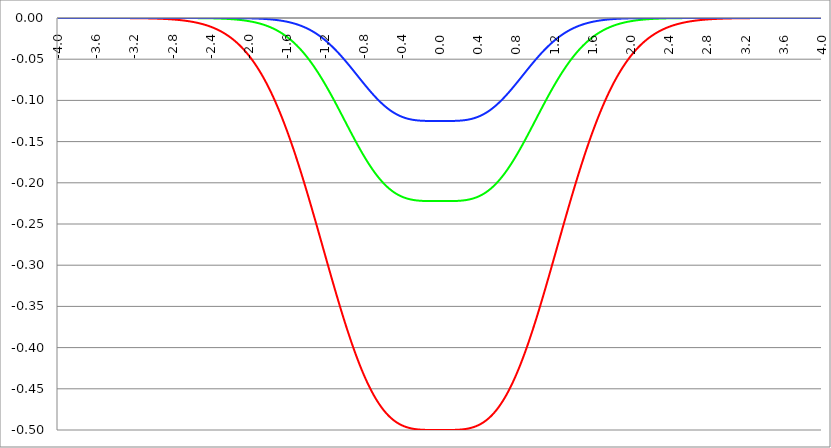
| Category | Series 1 | Series 0 | Series 2 |
|---|---|---|---|
| -4.0 | 0 | 0 | 0 |
| -3.996 | 0 | 0 | 0 |
| -3.992 | 0 | 0 | 0 |
| -3.988 | 0 | 0 | 0 |
| -3.984 | 0 | 0 | 0 |
| -3.98 | 0 | 0 | 0 |
| -3.976 | 0 | 0 | 0 |
| -3.972 | 0 | 0 | 0 |
| -3.968 | 0 | 0 | 0 |
| -3.964 | 0 | 0 | 0 |
| -3.96 | 0 | 0 | 0 |
| -3.956 | 0 | 0 | 0 |
| -3.952 | 0 | 0 | 0 |
| -3.948 | 0 | 0 | 0 |
| -3.944 | 0 | 0 | 0 |
| -3.94 | 0 | 0 | 0 |
| -3.936 | 0 | 0 | 0 |
| -3.932 | 0 | 0 | 0 |
| -3.928 | 0 | 0 | 0 |
| -3.924 | 0 | 0 | 0 |
| -3.92 | 0 | 0 | 0 |
| -3.916 | 0 | 0 | 0 |
| -3.912 | 0 | 0 | 0 |
| -3.908 | 0 | 0 | 0 |
| -3.904 | 0 | 0 | 0 |
| -3.9 | 0 | 0 | 0 |
| -3.896 | 0 | 0 | 0 |
| -3.892 | 0 | 0 | 0 |
| -3.888 | 0 | 0 | 0 |
| -3.884 | 0 | 0 | 0 |
| -3.88 | 0 | 0 | 0 |
| -3.876 | 0 | 0 | 0 |
| -3.872 | 0 | 0 | 0 |
| -3.868 | 0 | 0 | 0 |
| -3.864 | 0 | 0 | 0 |
| -3.86 | 0 | 0 | 0 |
| -3.856 | 0 | 0 | 0 |
| -3.852 | 0 | 0 | 0 |
| -3.848 | 0 | 0 | 0 |
| -3.844 | 0 | 0 | 0 |
| -3.84 | 0 | 0 | 0 |
| -3.836 | 0 | 0 | 0 |
| -3.832 | 0 | 0 | 0 |
| -3.828 | 0 | 0 | 0 |
| -3.824 | 0 | 0 | 0 |
| -3.82 | 0 | 0 | 0 |
| -3.816 | 0 | 0 | 0 |
| -3.812 | 0 | 0 | 0 |
| -3.808 | 0 | 0 | 0 |
| -3.804 | 0 | 0 | 0 |
| -3.8 | 0 | 0 | 0 |
| -3.796 | 0 | 0 | 0 |
| -3.792 | 0 | 0 | 0 |
| -3.788 | 0 | 0 | 0 |
| -3.784 | 0 | 0 | 0 |
| -3.78 | 0 | 0 | 0 |
| -3.776 | 0 | 0 | 0 |
| -3.772 | 0 | 0 | 0 |
| -3.768 | 0 | 0 | 0 |
| -3.764 | 0 | 0 | 0 |
| -3.76 | 0 | 0 | 0 |
| -3.756 | 0 | 0 | 0 |
| -3.752 | 0 | 0 | 0 |
| -3.748 | 0 | 0 | 0 |
| -3.744 | 0 | 0 | 0 |
| -3.74 | 0 | 0 | 0 |
| -3.736 | 0 | 0 | 0 |
| -3.732 | 0 | 0 | 0 |
| -3.728 | 0 | 0 | 0 |
| -3.724 | 0 | 0 | 0 |
| -3.72 | 0 | 0 | 0 |
| -3.716 | 0 | 0 | 0 |
| -3.712 | 0 | 0 | 0 |
| -3.708 | 0 | 0 | 0 |
| -3.704 | 0 | 0 | 0 |
| -3.7 | 0 | 0 | 0 |
| -3.696 | 0 | 0 | 0 |
| -3.692 | 0 | 0 | 0 |
| -3.688 | 0 | 0 | 0 |
| -3.684 | 0 | 0 | 0 |
| -3.68 | 0 | 0 | 0 |
| -3.676 | 0 | 0 | 0 |
| -3.672 | 0 | 0 | 0 |
| -3.668 | 0 | 0 | 0 |
| -3.664 | 0 | 0 | 0 |
| -3.66 | 0 | 0 | 0 |
| -3.656 | 0 | 0 | 0 |
| -3.652 | 0 | 0 | 0 |
| -3.648 | 0 | 0 | 0 |
| -3.644 | 0 | 0 | 0 |
| -3.64 | 0 | 0 | 0 |
| -3.636 | 0 | 0 | 0 |
| -3.632 | 0 | 0 | 0 |
| -3.628 | 0 | 0 | 0 |
| -3.624 | 0 | 0 | 0 |
| -3.62 | 0 | 0 | 0 |
| -3.616 | 0 | 0 | 0 |
| -3.612 | 0 | 0 | 0 |
| -3.608 | 0 | 0 | 0 |
| -3.604 | 0 | 0 | 0 |
| -3.6 | 0 | 0 | 0 |
| -3.596 | 0 | 0 | 0 |
| -3.592 | 0 | 0 | 0 |
| -3.588 | 0 | 0 | 0 |
| -3.584 | 0 | 0 | 0 |
| -3.58 | 0 | 0 | 0 |
| -3.576 | 0 | 0 | 0 |
| -3.572 | 0 | 0 | 0 |
| -3.568 | 0 | 0 | 0 |
| -3.564 | 0 | 0 | 0 |
| -3.56 | 0 | 0 | 0 |
| -3.556 | 0 | 0 | 0 |
| -3.552 | 0 | 0 | 0 |
| -3.548 | 0 | 0 | 0 |
| -3.544 | 0 | 0 | 0 |
| -3.54 | 0 | 0 | 0 |
| -3.536 | 0 | 0 | 0 |
| -3.532 | 0 | 0 | 0 |
| -3.528 | 0 | 0 | 0 |
| -3.524 | 0 | 0 | 0 |
| -3.52 | 0 | 0 | 0 |
| -3.516 | 0 | 0 | 0 |
| -3.512 | 0 | 0 | 0 |
| -3.508 | 0 | 0 | 0 |
| -3.504 | 0 | 0 | 0 |
| -3.5 | 0 | 0 | 0 |
| -3.496 | 0 | 0 | 0 |
| -3.492 | 0 | 0 | 0 |
| -3.488 | 0 | 0 | 0 |
| -3.484 | 0 | 0 | 0 |
| -3.48 | 0 | 0 | 0 |
| -3.476 | 0 | 0 | 0 |
| -3.472 | 0 | 0 | 0 |
| -3.467999999999999 | 0 | 0 | 0 |
| -3.463999999999999 | 0 | 0 | 0 |
| -3.459999999999999 | 0 | 0 | 0 |
| -3.455999999999999 | 0 | 0 | 0 |
| -3.451999999999999 | 0 | 0 | 0 |
| -3.447999999999999 | 0 | 0 | 0 |
| -3.443999999999999 | 0 | 0 | 0 |
| -3.439999999999999 | 0 | 0 | 0 |
| -3.435999999999999 | 0 | 0 | 0 |
| -3.431999999999999 | 0 | 0 | 0 |
| -3.427999999999999 | 0 | 0 | 0 |
| -3.423999999999999 | 0 | 0 | 0 |
| -3.419999999999999 | 0 | 0 | 0 |
| -3.415999999999999 | 0 | 0 | 0 |
| -3.411999999999999 | 0 | 0 | 0 |
| -3.407999999999999 | 0 | 0 | 0 |
| -3.403999999999999 | 0 | 0 | 0 |
| -3.399999999999999 | 0 | 0 | 0 |
| -3.395999999999999 | 0 | 0 | 0 |
| -3.391999999999999 | 0 | 0 | 0 |
| -3.387999999999999 | 0 | 0 | 0 |
| -3.383999999999999 | 0 | 0 | 0 |
| -3.379999999999999 | 0 | 0 | 0 |
| -3.375999999999999 | 0 | 0 | 0 |
| -3.371999999999999 | 0 | 0 | 0 |
| -3.367999999999999 | 0 | 0 | 0 |
| -3.363999999999999 | 0 | 0 | 0 |
| -3.359999999999999 | 0 | 0 | 0 |
| -3.355999999999999 | 0 | 0 | 0 |
| -3.351999999999999 | 0 | 0 | 0 |
| -3.347999999999999 | 0 | 0 | 0 |
| -3.343999999999999 | 0 | 0 | 0 |
| -3.339999999999999 | 0 | 0 | 0 |
| -3.335999999999999 | 0 | 0 | 0 |
| -3.331999999999999 | 0 | 0 | 0 |
| -3.327999999999999 | 0 | 0 | 0 |
| -3.323999999999999 | 0 | 0 | 0 |
| -3.319999999999999 | 0 | 0 | 0 |
| -3.315999999999999 | 0 | 0 | 0 |
| -3.311999999999999 | 0 | 0 | 0 |
| -3.307999999999999 | 0 | 0 | 0 |
| -3.303999999999999 | 0 | 0 | 0 |
| -3.299999999999999 | 0 | 0 | 0 |
| -3.295999999999999 | 0 | 0 | 0 |
| -3.291999999999999 | 0 | 0 | 0 |
| -3.288 | 0 | 0 | 0 |
| -3.284 | 0 | 0 | 0 |
| -3.279999999999999 | 0 | 0 | 0 |
| -3.275999999999999 | 0 | 0 | 0 |
| -3.271999999999999 | 0 | 0 | 0 |
| -3.268 | 0 | 0 | 0 |
| -3.264 | 0 | 0 | 0 |
| -3.259999999999999 | 0 | 0 | 0 |
| -3.255999999999999 | 0 | 0 | 0 |
| -3.251999999999999 | 0 | 0 | 0 |
| -3.248 | 0 | 0 | 0 |
| -3.244 | 0 | 0 | 0 |
| -3.239999999999999 | 0 | 0 | 0 |
| -3.235999999999999 | 0 | 0 | 0 |
| -3.231999999999999 | 0 | 0 | 0 |
| -3.228 | 0 | 0 | 0 |
| -3.224 | 0 | 0 | 0 |
| -3.219999999999999 | 0 | 0 | 0 |
| -3.215999999999999 | 0 | 0 | 0 |
| -3.211999999999999 | 0 | 0 | 0 |
| -3.208 | 0 | 0 | 0 |
| -3.204 | 0 | 0 | 0 |
| -3.199999999999999 | 0 | 0 | 0 |
| -3.195999999999999 | 0 | 0 | 0 |
| -3.191999999999999 | 0 | 0 | 0 |
| -3.188 | 0 | 0 | 0 |
| -3.184 | 0 | 0 | 0 |
| -3.179999999999999 | 0 | 0 | 0 |
| -3.175999999999999 | 0 | 0 | 0 |
| -3.171999999999999 | 0 | 0 | 0 |
| -3.168 | 0 | 0 | 0 |
| -3.164 | 0 | 0 | 0 |
| -3.159999999999999 | 0 | 0 | 0 |
| -3.155999999999999 | 0 | 0 | 0 |
| -3.151999999999999 | 0 | 0 | 0 |
| -3.148 | 0 | 0 | 0 |
| -3.144 | 0 | 0 | 0 |
| -3.139999999999999 | 0 | 0 | 0 |
| -3.135999999999999 | 0 | 0 | 0 |
| -3.131999999999999 | 0 | 0 | 0 |
| -3.128 | 0 | 0 | 0 |
| -3.124 | 0 | 0 | 0 |
| -3.119999999999999 | 0 | 0 | 0 |
| -3.115999999999999 | 0 | 0 | 0 |
| -3.111999999999999 | 0 | 0 | 0 |
| -3.108 | 0 | 0 | 0 |
| -3.104 | 0 | 0 | 0 |
| -3.099999999999999 | 0 | 0 | 0 |
| -3.095999999999999 | 0 | 0 | 0 |
| -3.091999999999999 | 0 | 0 | 0 |
| -3.088 | 0 | 0 | 0 |
| -3.084 | 0 | 0 | 0 |
| -3.079999999999999 | 0 | 0 | 0 |
| -3.075999999999999 | 0 | 0 | 0 |
| -3.071999999999999 | 0 | 0 | 0 |
| -3.068 | 0 | 0 | 0 |
| -3.064 | 0 | 0 | 0 |
| -3.059999999999999 | 0 | 0 | 0 |
| -3.055999999999999 | 0 | 0 | 0 |
| -3.051999999999999 | 0 | 0 | 0 |
| -3.048 | 0 | 0 | 0 |
| -3.044 | 0 | 0 | 0 |
| -3.039999999999999 | 0 | 0 | 0 |
| -3.035999999999999 | -0.001 | 0 | 0 |
| -3.031999999999999 | -0.001 | 0 | 0 |
| -3.028 | -0.001 | 0 | 0 |
| -3.024 | -0.001 | 0 | 0 |
| -3.019999999999999 | -0.001 | 0 | 0 |
| -3.015999999999999 | -0.001 | 0 | 0 |
| -3.011999999999999 | -0.001 | 0 | 0 |
| -3.008 | -0.001 | 0 | 0 |
| -3.004 | -0.001 | 0 | 0 |
| -2.999999999999999 | -0.001 | 0 | 0 |
| -2.995999999999999 | -0.001 | 0 | 0 |
| -2.991999999999999 | -0.001 | 0 | 0 |
| -2.988 | -0.001 | 0 | 0 |
| -2.984 | -0.001 | 0 | 0 |
| -2.979999999999999 | -0.001 | 0 | 0 |
| -2.975999999999999 | -0.001 | 0 | 0 |
| -2.971999999999999 | -0.001 | 0 | 0 |
| -2.968 | -0.001 | 0 | 0 |
| -2.964 | -0.001 | 0 | 0 |
| -2.959999999999999 | -0.001 | 0 | 0 |
| -2.955999999999999 | -0.001 | 0 | 0 |
| -2.951999999999999 | -0.001 | 0 | 0 |
| -2.948 | -0.001 | 0 | 0 |
| -2.944 | -0.001 | 0 | 0 |
| -2.939999999999999 | -0.001 | 0 | 0 |
| -2.935999999999999 | -0.001 | 0 | 0 |
| -2.931999999999999 | -0.001 | 0 | 0 |
| -2.928 | -0.001 | 0 | 0 |
| -2.924 | -0.001 | 0 | 0 |
| -2.919999999999999 | -0.001 | 0 | 0 |
| -2.915999999999999 | -0.001 | 0 | 0 |
| -2.911999999999999 | -0.001 | 0 | 0 |
| -2.908 | -0.001 | 0 | 0 |
| -2.904 | -0.001 | 0 | 0 |
| -2.899999999999999 | -0.001 | 0 | 0 |
| -2.895999999999999 | -0.001 | 0 | 0 |
| -2.891999999999999 | -0.001 | 0 | 0 |
| -2.887999999999999 | -0.001 | 0 | 0 |
| -2.883999999999999 | -0.001 | 0 | 0 |
| -2.879999999999999 | -0.001 | 0 | 0 |
| -2.875999999999999 | -0.001 | 0 | 0 |
| -2.871999999999999 | -0.001 | 0 | 0 |
| -2.867999999999999 | -0.001 | 0 | 0 |
| -2.863999999999999 | -0.001 | 0 | 0 |
| -2.859999999999999 | -0.001 | 0 | 0 |
| -2.855999999999999 | -0.001 | 0 | 0 |
| -2.851999999999999 | -0.001 | 0 | 0 |
| -2.847999999999999 | -0.001 | 0 | 0 |
| -2.843999999999999 | -0.001 | 0 | 0 |
| -2.839999999999999 | -0.001 | 0 | 0 |
| -2.835999999999999 | -0.001 | 0 | 0 |
| -2.831999999999999 | -0.001 | 0 | 0 |
| -2.827999999999999 | -0.002 | 0 | 0 |
| -2.823999999999999 | -0.002 | 0 | 0 |
| -2.819999999999999 | -0.002 | 0 | 0 |
| -2.815999999999999 | -0.002 | 0 | 0 |
| -2.811999999999999 | -0.002 | 0 | 0 |
| -2.807999999999999 | -0.002 | 0 | 0 |
| -2.803999999999999 | -0.002 | 0 | 0 |
| -2.799999999999999 | -0.002 | 0 | 0 |
| -2.795999999999999 | -0.002 | 0 | 0 |
| -2.791999999999999 | -0.002 | 0 | 0 |
| -2.787999999999999 | -0.002 | 0 | 0 |
| -2.783999999999999 | -0.002 | 0 | 0 |
| -2.779999999999999 | -0.002 | 0 | 0 |
| -2.775999999999999 | -0.002 | 0 | 0 |
| -2.771999999999999 | -0.002 | 0 | 0 |
| -2.767999999999999 | -0.002 | 0 | 0 |
| -2.763999999999999 | -0.002 | 0 | 0 |
| -2.759999999999999 | -0.002 | 0 | 0 |
| -2.755999999999999 | -0.002 | 0 | 0 |
| -2.751999999999999 | -0.002 | 0 | 0 |
| -2.747999999999999 | -0.002 | 0 | 0 |
| -2.743999999999999 | -0.002 | 0 | 0 |
| -2.739999999999999 | -0.002 | 0 | 0 |
| -2.735999999999999 | -0.002 | 0 | 0 |
| -2.731999999999999 | -0.002 | 0 | 0 |
| -2.727999999999999 | -0.002 | 0 | 0 |
| -2.723999999999999 | -0.003 | 0 | 0 |
| -2.719999999999999 | -0.003 | 0 | 0 |
| -2.715999999999999 | -0.003 | 0 | 0 |
| -2.711999999999999 | -0.003 | 0 | 0 |
| -2.707999999999999 | -0.003 | 0 | 0 |
| -2.703999999999999 | -0.003 | 0 | 0 |
| -2.699999999999999 | -0.003 | 0 | 0 |
| -2.695999999999999 | -0.003 | 0 | 0 |
| -2.691999999999999 | -0.003 | 0 | 0 |
| -2.687999999999999 | -0.003 | 0 | 0 |
| -2.683999999999999 | -0.003 | 0 | 0 |
| -2.679999999999999 | -0.003 | 0 | 0 |
| -2.675999999999999 | -0.003 | 0 | 0 |
| -2.671999999999999 | -0.003 | 0 | 0 |
| -2.667999999999999 | -0.003 | 0 | 0 |
| -2.663999999999999 | -0.003 | 0 | 0 |
| -2.659999999999999 | -0.003 | 0 | 0 |
| -2.655999999999999 | -0.003 | 0 | 0 |
| -2.651999999999999 | -0.004 | 0 | 0 |
| -2.647999999999999 | -0.004 | 0 | 0 |
| -2.643999999999999 | -0.004 | 0 | 0 |
| -2.639999999999999 | -0.004 | 0 | 0 |
| -2.635999999999999 | -0.004 | 0 | 0 |
| -2.631999999999999 | -0.004 | 0 | 0 |
| -2.627999999999999 | -0.004 | 0 | 0 |
| -2.623999999999999 | -0.004 | 0 | 0 |
| -2.619999999999999 | -0.004 | 0 | 0 |
| -2.615999999999999 | -0.004 | 0 | 0 |
| -2.611999999999999 | -0.004 | 0 | 0 |
| -2.607999999999999 | -0.004 | 0 | 0 |
| -2.603999999999999 | -0.004 | 0 | 0 |
| -2.599999999999999 | -0.004 | 0 | 0 |
| -2.595999999999999 | -0.005 | 0 | 0 |
| -2.591999999999999 | -0.005 | 0 | 0 |
| -2.587999999999999 | -0.005 | 0 | 0 |
| -2.583999999999999 | -0.005 | 0 | 0 |
| -2.579999999999999 | -0.005 | 0 | 0 |
| -2.575999999999999 | -0.005 | 0 | 0 |
| -2.571999999999999 | -0.005 | 0 | 0 |
| -2.567999999999999 | -0.005 | 0 | 0 |
| -2.563999999999999 | -0.005 | 0 | 0 |
| -2.559999999999999 | -0.005 | 0 | 0 |
| -2.555999999999999 | -0.005 | 0 | 0 |
| -2.551999999999999 | -0.006 | 0 | 0 |
| -2.547999999999999 | -0.006 | 0 | 0 |
| -2.543999999999999 | -0.006 | 0 | 0 |
| -2.539999999999999 | -0.006 | 0 | 0 |
| -2.535999999999999 | -0.006 | 0 | 0 |
| -2.531999999999999 | -0.006 | 0 | 0 |
| -2.527999999999999 | -0.006 | 0 | 0 |
| -2.523999999999999 | -0.006 | 0 | 0 |
| -2.519999999999999 | -0.006 | 0 | 0 |
| -2.515999999999999 | -0.007 | 0 | 0 |
| -2.511999999999999 | -0.007 | 0 | 0 |
| -2.507999999999999 | -0.007 | 0 | 0 |
| -2.503999999999999 | -0.007 | 0 | 0 |
| -2.499999999999999 | -0.007 | 0 | 0 |
| -2.495999999999999 | -0.007 | 0 | 0 |
| -2.491999999999999 | -0.007 | 0 | 0 |
| -2.487999999999999 | -0.007 | 0 | 0 |
| -2.483999999999999 | -0.007 | 0 | 0 |
| -2.479999999999999 | -0.008 | 0 | 0 |
| -2.475999999999999 | -0.008 | 0 | 0 |
| -2.471999999999999 | -0.008 | 0 | 0 |
| -2.467999999999999 | -0.008 | 0 | 0 |
| -2.463999999999999 | -0.008 | 0 | 0 |
| -2.459999999999999 | -0.008 | 0 | 0 |
| -2.455999999999999 | -0.008 | 0 | 0 |
| -2.451999999999999 | -0.009 | 0 | 0 |
| -2.447999999999999 | -0.009 | 0 | 0 |
| -2.443999999999999 | -0.009 | 0 | 0 |
| -2.439999999999999 | -0.009 | 0 | 0 |
| -2.435999999999999 | -0.009 | 0 | 0 |
| -2.431999999999999 | -0.009 | 0 | 0 |
| -2.427999999999999 | -0.009 | 0 | 0 |
| -2.423999999999999 | -0.01 | 0 | 0 |
| -2.419999999999999 | -0.01 | 0 | 0 |
| -2.415999999999999 | -0.01 | 0 | 0 |
| -2.411999999999999 | -0.01 | 0 | 0 |
| -2.407999999999999 | -0.01 | 0 | 0 |
| -2.403999999999999 | -0.01 | 0 | 0 |
| -2.399999999999999 | -0.011 | 0 | 0 |
| -2.395999999999999 | -0.011 | 0 | 0 |
| -2.391999999999999 | -0.011 | 0 | 0 |
| -2.387999999999999 | -0.011 | 0 | 0 |
| -2.383999999999999 | -0.011 | 0 | 0 |
| -2.379999999999999 | -0.012 | 0 | 0 |
| -2.375999999999999 | -0.012 | 0 | 0 |
| -2.371999999999999 | -0.012 | 0 | 0 |
| -2.367999999999998 | -0.012 | 0 | 0 |
| -2.363999999999998 | -0.012 | 0 | 0 |
| -2.359999999999998 | -0.013 | 0 | 0 |
| -2.355999999999998 | -0.013 | -0.001 | 0 |
| -2.351999999999998 | -0.013 | -0.001 | 0 |
| -2.347999999999998 | -0.013 | -0.001 | 0 |
| -2.343999999999998 | -0.013 | -0.001 | 0 |
| -2.339999999999998 | -0.014 | -0.001 | 0 |
| -2.335999999999998 | -0.014 | -0.001 | 0 |
| -2.331999999999998 | -0.014 | -0.001 | 0 |
| -2.327999999999998 | -0.014 | -0.001 | 0 |
| -2.323999999999998 | -0.014 | -0.001 | 0 |
| -2.319999999999998 | -0.015 | -0.001 | 0 |
| -2.315999999999998 | -0.015 | -0.001 | 0 |
| -2.311999999999998 | -0.015 | -0.001 | 0 |
| -2.307999999999998 | -0.015 | -0.001 | 0 |
| -2.303999999999998 | -0.016 | -0.001 | 0 |
| -2.299999999999998 | -0.016 | -0.001 | 0 |
| -2.295999999999998 | -0.016 | -0.001 | 0 |
| -2.291999999999998 | -0.016 | -0.001 | 0 |
| -2.287999999999998 | -0.017 | -0.001 | 0 |
| -2.283999999999998 | -0.017 | -0.001 | 0 |
| -2.279999999999998 | -0.017 | -0.001 | 0 |
| -2.275999999999998 | -0.017 | -0.001 | 0 |
| -2.271999999999998 | -0.018 | -0.001 | 0 |
| -2.267999999999998 | -0.018 | -0.001 | 0 |
| -2.263999999999998 | -0.018 | -0.001 | 0 |
| -2.259999999999998 | -0.018 | -0.001 | 0 |
| -2.255999999999998 | -0.019 | -0.001 | 0 |
| -2.251999999999998 | -0.019 | -0.001 | 0 |
| -2.247999999999998 | -0.019 | -0.001 | 0 |
| -2.243999999999998 | -0.02 | -0.001 | 0 |
| -2.239999999999998 | -0.02 | -0.001 | 0 |
| -2.235999999999998 | -0.02 | -0.001 | 0 |
| -2.231999999999998 | -0.021 | -0.001 | 0 |
| -2.227999999999998 | -0.021 | -0.001 | 0 |
| -2.223999999999998 | -0.021 | -0.001 | 0 |
| -2.219999999999998 | -0.021 | -0.001 | 0 |
| -2.215999999999998 | -0.022 | -0.001 | 0 |
| -2.211999999999998 | -0.022 | -0.001 | 0 |
| -2.207999999999998 | -0.022 | -0.001 | 0 |
| -2.203999999999998 | -0.023 | -0.001 | 0 |
| -2.199999999999998 | -0.023 | -0.001 | 0 |
| -2.195999999999998 | -0.023 | -0.001 | 0 |
| -2.191999999999998 | -0.024 | -0.001 | 0 |
| -2.187999999999998 | -0.024 | -0.001 | 0 |
| -2.183999999999998 | -0.024 | -0.001 | 0 |
| -2.179999999999998 | -0.025 | -0.001 | 0 |
| -2.175999999999998 | -0.025 | -0.001 | 0 |
| -2.171999999999998 | -0.026 | -0.002 | 0 |
| -2.167999999999998 | -0.026 | -0.002 | 0 |
| -2.163999999999998 | -0.026 | -0.002 | 0 |
| -2.159999999999998 | -0.027 | -0.002 | 0 |
| -2.155999999999998 | -0.027 | -0.002 | 0 |
| -2.151999999999998 | -0.027 | -0.002 | 0 |
| -2.147999999999998 | -0.028 | -0.002 | 0 |
| -2.143999999999998 | -0.028 | -0.002 | 0 |
| -2.139999999999998 | -0.029 | -0.002 | 0 |
| -2.135999999999998 | -0.029 | -0.002 | 0 |
| -2.131999999999998 | -0.029 | -0.002 | 0 |
| -2.127999999999998 | -0.03 | -0.002 | 0 |
| -2.123999999999998 | -0.03 | -0.002 | 0 |
| -2.119999999999998 | -0.031 | -0.002 | 0 |
| -2.115999999999998 | -0.031 | -0.002 | 0 |
| -2.111999999999998 | -0.032 | -0.002 | 0 |
| -2.107999999999998 | -0.032 | -0.002 | 0 |
| -2.103999999999998 | -0.032 | -0.002 | 0 |
| -2.099999999999998 | -0.033 | -0.002 | 0 |
| -2.095999999999998 | -0.033 | -0.002 | 0 |
| -2.091999999999998 | -0.034 | -0.002 | 0 |
| -2.087999999999998 | -0.034 | -0.002 | 0 |
| -2.083999999999998 | -0.035 | -0.002 | 0 |
| -2.079999999999998 | -0.035 | -0.003 | 0 |
| -2.075999999999998 | -0.036 | -0.003 | 0 |
| -2.071999999999998 | -0.036 | -0.003 | 0 |
| -2.067999999999998 | -0.037 | -0.003 | 0 |
| -2.063999999999998 | -0.037 | -0.003 | 0 |
| -2.059999999999998 | -0.038 | -0.003 | 0 |
| -2.055999999999998 | -0.038 | -0.003 | 0 |
| -2.051999999999998 | -0.039 | -0.003 | 0 |
| -2.047999999999998 | -0.039 | -0.003 | 0 |
| -2.043999999999998 | -0.04 | -0.003 | 0 |
| -2.039999999999998 | -0.04 | -0.003 | 0 |
| -2.035999999999998 | -0.041 | -0.003 | 0 |
| -2.031999999999998 | -0.041 | -0.003 | 0 |
| -2.027999999999998 | -0.042 | -0.003 | 0 |
| -2.023999999999998 | -0.042 | -0.003 | 0 |
| -2.019999999999998 | -0.043 | -0.003 | 0 |
| -2.015999999999998 | -0.043 | -0.004 | 0 |
| -2.011999999999998 | -0.044 | -0.004 | 0 |
| -2.007999999999998 | -0.045 | -0.004 | 0 |
| -2.003999999999998 | -0.045 | -0.004 | 0 |
| -1.999999999999998 | -0.046 | -0.004 | 0 |
| -1.995999999999998 | -0.046 | -0.004 | 0 |
| -1.991999999999998 | -0.047 | -0.004 | 0 |
| -1.987999999999998 | -0.048 | -0.004 | 0 |
| -1.983999999999998 | -0.048 | -0.004 | 0 |
| -1.979999999999998 | -0.049 | -0.004 | 0 |
| -1.975999999999998 | -0.049 | -0.004 | 0 |
| -1.971999999999998 | -0.05 | -0.004 | 0 |
| -1.967999999999998 | -0.051 | -0.005 | 0 |
| -1.963999999999998 | -0.051 | -0.005 | 0 |
| -1.959999999999998 | -0.052 | -0.005 | 0 |
| -1.955999999999998 | -0.053 | -0.005 | -0.001 |
| -1.951999999999998 | -0.053 | -0.005 | -0.001 |
| -1.947999999999998 | -0.054 | -0.005 | -0.001 |
| -1.943999999999998 | -0.055 | -0.005 | -0.001 |
| -1.939999999999998 | -0.055 | -0.005 | -0.001 |
| -1.935999999999998 | -0.056 | -0.005 | -0.001 |
| -1.931999999999998 | -0.057 | -0.005 | -0.001 |
| -1.927999999999998 | -0.057 | -0.006 | -0.001 |
| -1.923999999999998 | -0.058 | -0.006 | -0.001 |
| -1.919999999999998 | -0.059 | -0.006 | -0.001 |
| -1.915999999999998 | -0.059 | -0.006 | -0.001 |
| -1.911999999999998 | -0.06 | -0.006 | -0.001 |
| -1.907999999999998 | -0.061 | -0.006 | -0.001 |
| -1.903999999999998 | -0.062 | -0.006 | -0.001 |
| -1.899999999999998 | -0.062 | -0.006 | -0.001 |
| -1.895999999999998 | -0.063 | -0.006 | -0.001 |
| -1.891999999999998 | -0.064 | -0.007 | -0.001 |
| -1.887999999999998 | -0.065 | -0.007 | -0.001 |
| -1.883999999999998 | -0.065 | -0.007 | -0.001 |
| -1.879999999999998 | -0.066 | -0.007 | -0.001 |
| -1.875999999999998 | -0.067 | -0.007 | -0.001 |
| -1.871999999999998 | -0.068 | -0.007 | -0.001 |
| -1.867999999999998 | -0.069 | -0.007 | -0.001 |
| -1.863999999999998 | -0.069 | -0.008 | -0.001 |
| -1.859999999999998 | -0.07 | -0.008 | -0.001 |
| -1.855999999999998 | -0.071 | -0.008 | -0.001 |
| -1.851999999999998 | -0.072 | -0.008 | -0.001 |
| -1.847999999999998 | -0.073 | -0.008 | -0.001 |
| -1.843999999999998 | -0.073 | -0.008 | -0.001 |
| -1.839999999999998 | -0.074 | -0.008 | -0.001 |
| -1.835999999999998 | -0.075 | -0.009 | -0.001 |
| -1.831999999999998 | -0.076 | -0.009 | -0.001 |
| -1.827999999999998 | -0.077 | -0.009 | -0.001 |
| -1.823999999999998 | -0.078 | -0.009 | -0.001 |
| -1.819999999999998 | -0.079 | -0.009 | -0.001 |
| -1.815999999999998 | -0.079 | -0.009 | -0.001 |
| -1.811999999999998 | -0.08 | -0.01 | -0.001 |
| -1.807999999999998 | -0.081 | -0.01 | -0.001 |
| -1.803999999999998 | -0.082 | -0.01 | -0.001 |
| -1.799999999999998 | -0.083 | -0.01 | -0.001 |
| -1.795999999999998 | -0.084 | -0.01 | -0.001 |
| -1.791999999999998 | -0.085 | -0.01 | -0.002 |
| -1.787999999999998 | -0.086 | -0.011 | -0.002 |
| -1.783999999999998 | -0.087 | -0.011 | -0.002 |
| -1.779999999999998 | -0.088 | -0.011 | -0.002 |
| -1.775999999999998 | -0.089 | -0.011 | -0.002 |
| -1.771999999999998 | -0.09 | -0.011 | -0.002 |
| -1.767999999999998 | -0.091 | -0.012 | -0.002 |
| -1.763999999999998 | -0.092 | -0.012 | -0.002 |
| -1.759999999999998 | -0.093 | -0.012 | -0.002 |
| -1.755999999999998 | -0.094 | -0.012 | -0.002 |
| -1.751999999999998 | -0.095 | -0.012 | -0.002 |
| -1.747999999999998 | -0.096 | -0.013 | -0.002 |
| -1.743999999999998 | -0.097 | -0.013 | -0.002 |
| -1.739999999999998 | -0.098 | -0.013 | -0.002 |
| -1.735999999999998 | -0.099 | -0.013 | -0.002 |
| -1.731999999999998 | -0.1 | -0.014 | -0.002 |
| -1.727999999999998 | -0.101 | -0.014 | -0.002 |
| -1.723999999999998 | -0.102 | -0.014 | -0.002 |
| -1.719999999999998 | -0.103 | -0.014 | -0.002 |
| -1.715999999999998 | -0.104 | -0.015 | -0.002 |
| -1.711999999999998 | -0.105 | -0.015 | -0.002 |
| -1.707999999999998 | -0.106 | -0.015 | -0.002 |
| -1.703999999999998 | -0.107 | -0.015 | -0.003 |
| -1.699999999999998 | -0.108 | -0.016 | -0.003 |
| -1.695999999999998 | -0.109 | -0.016 | -0.003 |
| -1.691999999999998 | -0.11 | -0.016 | -0.003 |
| -1.687999999999998 | -0.111 | -0.016 | -0.003 |
| -1.683999999999998 | -0.113 | -0.017 | -0.003 |
| -1.679999999999998 | -0.114 | -0.017 | -0.003 |
| -1.675999999999998 | -0.115 | -0.017 | -0.003 |
| -1.671999999999998 | -0.116 | -0.017 | -0.003 |
| -1.667999999999998 | -0.117 | -0.018 | -0.003 |
| -1.663999999999998 | -0.118 | -0.018 | -0.003 |
| -1.659999999999998 | -0.119 | -0.018 | -0.003 |
| -1.655999999999998 | -0.121 | -0.019 | -0.003 |
| -1.651999999999998 | -0.122 | -0.019 | -0.003 |
| -1.647999999999998 | -0.123 | -0.019 | -0.004 |
| -1.643999999999998 | -0.124 | -0.019 | -0.004 |
| -1.639999999999998 | -0.125 | -0.02 | -0.004 |
| -1.635999999999998 | -0.126 | -0.02 | -0.004 |
| -1.631999999999998 | -0.128 | -0.02 | -0.004 |
| -1.627999999999998 | -0.129 | -0.021 | -0.004 |
| -1.623999999999998 | -0.13 | -0.021 | -0.004 |
| -1.619999999999998 | -0.131 | -0.021 | -0.004 |
| -1.615999999999998 | -0.133 | -0.022 | -0.004 |
| -1.611999999999998 | -0.134 | -0.022 | -0.004 |
| -1.607999999999998 | -0.135 | -0.022 | -0.004 |
| -1.603999999999998 | -0.136 | -0.023 | -0.004 |
| -1.599999999999998 | -0.138 | -0.023 | -0.005 |
| -1.595999999999998 | -0.139 | -0.023 | -0.005 |
| -1.591999999999998 | -0.14 | -0.024 | -0.005 |
| -1.587999999999998 | -0.141 | -0.024 | -0.005 |
| -1.583999999999998 | -0.143 | -0.025 | -0.005 |
| -1.579999999999998 | -0.144 | -0.025 | -0.005 |
| -1.575999999999998 | -0.145 | -0.025 | -0.005 |
| -1.571999999999998 | -0.147 | -0.026 | -0.005 |
| -1.567999999999998 | -0.148 | -0.026 | -0.005 |
| -1.563999999999998 | -0.149 | -0.026 | -0.006 |
| -1.559999999999998 | -0.151 | -0.027 | -0.006 |
| -1.555999999999998 | -0.152 | -0.027 | -0.006 |
| -1.551999999999998 | -0.153 | -0.028 | -0.006 |
| -1.547999999999998 | -0.155 | -0.028 | -0.006 |
| -1.543999999999998 | -0.156 | -0.028 | -0.006 |
| -1.539999999999998 | -0.157 | -0.029 | -0.006 |
| -1.535999999999998 | -0.159 | -0.029 | -0.006 |
| -1.531999999999998 | -0.16 | -0.03 | -0.007 |
| -1.527999999999998 | -0.161 | -0.03 | -0.007 |
| -1.523999999999998 | -0.163 | -0.031 | -0.007 |
| -1.519999999999998 | -0.164 | -0.031 | -0.007 |
| -1.515999999999998 | -0.166 | -0.031 | -0.007 |
| -1.511999999999998 | -0.167 | -0.032 | -0.007 |
| -1.507999999999998 | -0.168 | -0.032 | -0.007 |
| -1.503999999999998 | -0.17 | -0.033 | -0.007 |
| -1.499999999999998 | -0.171 | -0.033 | -0.008 |
| -1.495999999999998 | -0.173 | -0.034 | -0.008 |
| -1.491999999999998 | -0.174 | -0.034 | -0.008 |
| -1.487999999999998 | -0.176 | -0.035 | -0.008 |
| -1.483999999999998 | -0.177 | -0.035 | -0.008 |
| -1.479999999999998 | -0.178 | -0.036 | -0.008 |
| -1.475999999999998 | -0.18 | -0.036 | -0.009 |
| -1.471999999999998 | -0.181 | -0.037 | -0.009 |
| -1.467999999999998 | -0.183 | -0.037 | -0.009 |
| -1.463999999999998 | -0.184 | -0.038 | -0.009 |
| -1.459999999999998 | -0.186 | -0.038 | -0.009 |
| -1.455999999999998 | -0.187 | -0.039 | -0.009 |
| -1.451999999999998 | -0.189 | -0.039 | -0.01 |
| -1.447999999999998 | -0.19 | -0.04 | -0.01 |
| -1.443999999999998 | -0.192 | -0.04 | -0.01 |
| -1.439999999999998 | -0.193 | -0.041 | -0.01 |
| -1.435999999999998 | -0.195 | -0.041 | -0.01 |
| -1.431999999999998 | -0.196 | -0.042 | -0.011 |
| -1.427999999999998 | -0.198 | -0.042 | -0.011 |
| -1.423999999999998 | -0.199 | -0.043 | -0.011 |
| -1.419999999999998 | -0.201 | -0.043 | -0.011 |
| -1.415999999999998 | -0.202 | -0.044 | -0.011 |
| -1.411999999999998 | -0.204 | -0.045 | -0.012 |
| -1.407999999999998 | -0.205 | -0.045 | -0.012 |
| -1.403999999999998 | -0.207 | -0.046 | -0.012 |
| -1.399999999999998 | -0.208 | -0.046 | -0.012 |
| -1.395999999999998 | -0.21 | -0.047 | -0.012 |
| -1.391999999999998 | -0.212 | -0.047 | -0.013 |
| -1.387999999999998 | -0.213 | -0.048 | -0.013 |
| -1.383999999999998 | -0.215 | -0.049 | -0.013 |
| -1.379999999999998 | -0.216 | -0.049 | -0.013 |
| -1.375999999999998 | -0.218 | -0.05 | -0.014 |
| -1.371999999999998 | -0.219 | -0.05 | -0.014 |
| -1.367999999999998 | -0.221 | -0.051 | -0.014 |
| -1.363999999999998 | -0.223 | -0.052 | -0.014 |
| -1.359999999999998 | -0.224 | -0.052 | -0.015 |
| -1.355999999999998 | -0.226 | -0.053 | -0.015 |
| -1.351999999999998 | -0.227 | -0.054 | -0.015 |
| -1.347999999999998 | -0.229 | -0.054 | -0.015 |
| -1.343999999999998 | -0.23 | -0.055 | -0.016 |
| -1.339999999999998 | -0.232 | -0.056 | -0.016 |
| -1.335999999999998 | -0.234 | -0.056 | -0.016 |
| -1.331999999999998 | -0.235 | -0.057 | -0.016 |
| -1.327999999999998 | -0.237 | -0.057 | -0.017 |
| -1.323999999999998 | -0.238 | -0.058 | -0.017 |
| -1.319999999999998 | -0.24 | -0.059 | -0.017 |
| -1.315999999999998 | -0.242 | -0.06 | -0.017 |
| -1.311999999999998 | -0.243 | -0.06 | -0.018 |
| -1.307999999999998 | -0.245 | -0.061 | -0.018 |
| -1.303999999999998 | -0.247 | -0.062 | -0.018 |
| -1.299999999999998 | -0.248 | -0.062 | -0.019 |
| -1.295999999999998 | -0.25 | -0.063 | -0.019 |
| -1.291999999999998 | -0.251 | -0.064 | -0.019 |
| -1.287999999999998 | -0.253 | -0.064 | -0.02 |
| -1.283999999999998 | -0.255 | -0.065 | -0.02 |
| -1.279999999999998 | -0.256 | -0.066 | -0.02 |
| -1.275999999999998 | -0.258 | -0.067 | -0.02 |
| -1.271999999999998 | -0.26 | -0.067 | -0.021 |
| -1.267999999999998 | -0.261 | -0.068 | -0.021 |
| -1.263999999999998 | -0.263 | -0.069 | -0.021 |
| -1.259999999999998 | -0.264 | -0.069 | -0.022 |
| -1.255999999999998 | -0.266 | -0.07 | -0.022 |
| -1.251999999999998 | -0.268 | -0.071 | -0.022 |
| -1.247999999999998 | -0.269 | -0.072 | -0.023 |
| -1.243999999999998 | -0.271 | -0.072 | -0.023 |
| -1.239999999999998 | -0.273 | -0.073 | -0.024 |
| -1.235999999999998 | -0.274 | -0.074 | -0.024 |
| -1.231999999999998 | -0.276 | -0.075 | -0.024 |
| -1.227999999999998 | -0.278 | -0.075 | -0.025 |
| -1.223999999999998 | -0.279 | -0.076 | -0.025 |
| -1.219999999999998 | -0.281 | -0.077 | -0.025 |
| -1.215999999999998 | -0.282 | -0.078 | -0.026 |
| -1.211999999999998 | -0.284 | -0.079 | -0.026 |
| -1.207999999999998 | -0.286 | -0.079 | -0.026 |
| -1.203999999999998 | -0.287 | -0.08 | -0.027 |
| -1.199999999999997 | -0.289 | -0.081 | -0.027 |
| -1.195999999999997 | -0.291 | -0.082 | -0.028 |
| -1.191999999999997 | -0.292 | -0.083 | -0.028 |
| -1.187999999999997 | -0.294 | -0.083 | -0.028 |
| -1.183999999999997 | -0.296 | -0.084 | -0.029 |
| -1.179999999999997 | -0.297 | -0.085 | -0.029 |
| -1.175999999999997 | -0.299 | -0.086 | -0.03 |
| -1.171999999999997 | -0.3 | -0.087 | -0.03 |
| -1.167999999999997 | -0.302 | -0.087 | -0.03 |
| -1.163999999999997 | -0.304 | -0.088 | -0.031 |
| -1.159999999999997 | -0.305 | -0.089 | -0.031 |
| -1.155999999999997 | -0.307 | -0.09 | -0.032 |
| -1.151999999999997 | -0.309 | -0.091 | -0.032 |
| -1.147999999999997 | -0.31 | -0.092 | -0.033 |
| -1.143999999999997 | -0.312 | -0.092 | -0.033 |
| -1.139999999999997 | -0.313 | -0.093 | -0.033 |
| -1.135999999999997 | -0.315 | -0.094 | -0.034 |
| -1.131999999999997 | -0.317 | -0.095 | -0.034 |
| -1.127999999999997 | -0.318 | -0.096 | -0.035 |
| -1.123999999999997 | -0.32 | -0.097 | -0.035 |
| -1.119999999999997 | -0.322 | -0.098 | -0.036 |
| -1.115999999999997 | -0.323 | -0.098 | -0.036 |
| -1.111999999999997 | -0.325 | -0.099 | -0.037 |
| -1.107999999999997 | -0.326 | -0.1 | -0.037 |
| -1.103999999999997 | -0.328 | -0.101 | -0.038 |
| -1.099999999999997 | -0.33 | -0.102 | -0.038 |
| -1.095999999999997 | -0.331 | -0.103 | -0.038 |
| -1.091999999999997 | -0.333 | -0.104 | -0.039 |
| -1.087999999999997 | -0.334 | -0.104 | -0.039 |
| -1.083999999999997 | -0.336 | -0.105 | -0.04 |
| -1.079999999999997 | -0.337 | -0.106 | -0.04 |
| -1.075999999999997 | -0.339 | -0.107 | -0.041 |
| -1.071999999999997 | -0.341 | -0.108 | -0.041 |
| -1.067999999999997 | -0.342 | -0.109 | -0.042 |
| -1.063999999999997 | -0.344 | -0.11 | -0.042 |
| -1.059999999999997 | -0.345 | -0.111 | -0.043 |
| -1.055999999999997 | -0.347 | -0.112 | -0.043 |
| -1.051999999999997 | -0.348 | -0.112 | -0.044 |
| -1.047999999999997 | -0.35 | -0.113 | -0.044 |
| -1.043999999999997 | -0.351 | -0.114 | -0.045 |
| -1.039999999999997 | -0.353 | -0.115 | -0.045 |
| -1.035999999999997 | -0.354 | -0.116 | -0.046 |
| -1.031999999999997 | -0.356 | -0.117 | -0.046 |
| -1.027999999999997 | -0.357 | -0.118 | -0.047 |
| -1.023999999999997 | -0.359 | -0.119 | -0.048 |
| -1.019999999999997 | -0.36 | -0.12 | -0.048 |
| -1.015999999999997 | -0.362 | -0.12 | -0.049 |
| -1.011999999999997 | -0.363 | -0.121 | -0.049 |
| -1.007999999999997 | -0.365 | -0.122 | -0.05 |
| -1.003999999999997 | -0.366 | -0.123 | -0.05 |
| -0.999999999999997 | -0.368 | -0.124 | -0.051 |
| -0.995999999999997 | -0.369 | -0.125 | -0.051 |
| -0.991999999999997 | -0.371 | -0.126 | -0.052 |
| -0.987999999999997 | -0.372 | -0.127 | -0.052 |
| -0.983999999999997 | -0.374 | -0.128 | -0.053 |
| -0.979999999999997 | -0.375 | -0.128 | -0.053 |
| -0.975999999999997 | -0.377 | -0.129 | -0.054 |
| -0.971999999999997 | -0.378 | -0.13 | -0.055 |
| -0.967999999999997 | -0.379 | -0.131 | -0.055 |
| -0.963999999999997 | -0.381 | -0.132 | -0.056 |
| -0.959999999999997 | -0.382 | -0.133 | -0.056 |
| -0.955999999999997 | -0.384 | -0.134 | -0.057 |
| -0.951999999999997 | -0.385 | -0.135 | -0.057 |
| -0.947999999999997 | -0.386 | -0.136 | -0.058 |
| -0.943999999999997 | -0.388 | -0.136 | -0.059 |
| -0.939999999999997 | -0.389 | -0.137 | -0.059 |
| -0.935999999999997 | -0.391 | -0.138 | -0.06 |
| -0.931999999999997 | -0.392 | -0.139 | -0.06 |
| -0.927999999999997 | -0.393 | -0.14 | -0.061 |
| -0.923999999999997 | -0.395 | -0.141 | -0.061 |
| -0.919999999999997 | -0.396 | -0.142 | -0.062 |
| -0.915999999999997 | -0.397 | -0.143 | -0.063 |
| -0.911999999999997 | -0.399 | -0.143 | -0.063 |
| -0.907999999999997 | -0.4 | -0.144 | -0.064 |
| -0.903999999999997 | -0.401 | -0.145 | -0.064 |
| -0.899999999999997 | -0.403 | -0.146 | -0.065 |
| -0.895999999999997 | -0.404 | -0.147 | -0.065 |
| -0.891999999999997 | -0.405 | -0.148 | -0.066 |
| -0.887999999999997 | -0.406 | -0.149 | -0.067 |
| -0.883999999999997 | -0.408 | -0.149 | -0.067 |
| -0.879999999999997 | -0.409 | -0.15 | -0.068 |
| -0.875999999999997 | -0.41 | -0.151 | -0.068 |
| -0.871999999999997 | -0.411 | -0.152 | -0.069 |
| -0.867999999999997 | -0.413 | -0.153 | -0.069 |
| -0.863999999999997 | -0.414 | -0.154 | -0.07 |
| -0.859999999999997 | -0.415 | -0.155 | -0.071 |
| -0.855999999999997 | -0.416 | -0.155 | -0.071 |
| -0.851999999999997 | -0.418 | -0.156 | -0.072 |
| -0.847999999999997 | -0.419 | -0.157 | -0.072 |
| -0.843999999999997 | -0.42 | -0.158 | -0.073 |
| -0.839999999999997 | -0.421 | -0.159 | -0.073 |
| -0.835999999999997 | -0.422 | -0.16 | -0.074 |
| -0.831999999999997 | -0.423 | -0.16 | -0.075 |
| -0.827999999999997 | -0.425 | -0.161 | -0.075 |
| -0.823999999999997 | -0.426 | -0.162 | -0.076 |
| -0.819999999999997 | -0.427 | -0.163 | -0.076 |
| -0.815999999999997 | -0.428 | -0.164 | -0.077 |
| -0.811999999999997 | -0.429 | -0.164 | -0.078 |
| -0.807999999999997 | -0.43 | -0.165 | -0.078 |
| -0.803999999999997 | -0.431 | -0.166 | -0.079 |
| -0.799999999999997 | -0.432 | -0.167 | -0.079 |
| -0.795999999999997 | -0.433 | -0.168 | -0.08 |
| -0.791999999999997 | -0.435 | -0.168 | -0.08 |
| -0.787999999999997 | -0.436 | -0.169 | -0.081 |
| -0.783999999999997 | -0.437 | -0.17 | -0.082 |
| -0.779999999999997 | -0.438 | -0.171 | -0.082 |
| -0.775999999999997 | -0.439 | -0.171 | -0.083 |
| -0.771999999999997 | -0.44 | -0.172 | -0.083 |
| -0.767999999999997 | -0.441 | -0.173 | -0.084 |
| -0.763999999999997 | -0.442 | -0.174 | -0.084 |
| -0.759999999999997 | -0.443 | -0.174 | -0.085 |
| -0.755999999999997 | -0.444 | -0.175 | -0.085 |
| -0.751999999999997 | -0.445 | -0.176 | -0.086 |
| -0.747999999999997 | -0.446 | -0.177 | -0.087 |
| -0.743999999999997 | -0.447 | -0.177 | -0.087 |
| -0.739999999999997 | -0.448 | -0.178 | -0.088 |
| -0.735999999999997 | -0.448 | -0.179 | -0.088 |
| -0.731999999999997 | -0.449 | -0.179 | -0.089 |
| -0.727999999999997 | -0.45 | -0.18 | -0.089 |
| -0.723999999999997 | -0.451 | -0.181 | -0.09 |
| -0.719999999999997 | -0.452 | -0.182 | -0.09 |
| -0.715999999999997 | -0.453 | -0.182 | -0.091 |
| -0.711999999999997 | -0.454 | -0.183 | -0.091 |
| -0.707999999999997 | -0.455 | -0.184 | -0.092 |
| -0.703999999999997 | -0.456 | -0.184 | -0.092 |
| -0.699999999999997 | -0.456 | -0.185 | -0.093 |
| -0.695999999999997 | -0.457 | -0.186 | -0.093 |
| -0.691999999999997 | -0.458 | -0.186 | -0.094 |
| -0.687999999999997 | -0.459 | -0.187 | -0.094 |
| -0.683999999999997 | -0.46 | -0.187 | -0.095 |
| -0.679999999999997 | -0.46 | -0.188 | -0.095 |
| -0.675999999999997 | -0.461 | -0.189 | -0.096 |
| -0.671999999999997 | -0.462 | -0.189 | -0.096 |
| -0.667999999999997 | -0.463 | -0.19 | -0.097 |
| -0.663999999999997 | -0.464 | -0.191 | -0.097 |
| -0.659999999999997 | -0.464 | -0.191 | -0.098 |
| -0.655999999999997 | -0.465 | -0.192 | -0.098 |
| -0.651999999999997 | -0.466 | -0.192 | -0.099 |
| -0.647999999999997 | -0.467 | -0.193 | -0.099 |
| -0.643999999999997 | -0.467 | -0.194 | -0.1 |
| -0.639999999999997 | -0.468 | -0.194 | -0.1 |
| -0.635999999999997 | -0.469 | -0.195 | -0.101 |
| -0.631999999999997 | -0.469 | -0.195 | -0.101 |
| -0.627999999999997 | -0.47 | -0.196 | -0.102 |
| -0.623999999999997 | -0.471 | -0.196 | -0.102 |
| -0.619999999999997 | -0.471 | -0.197 | -0.102 |
| -0.615999999999997 | -0.472 | -0.197 | -0.103 |
| -0.611999999999997 | -0.473 | -0.198 | -0.103 |
| -0.607999999999997 | -0.473 | -0.198 | -0.104 |
| -0.603999999999997 | -0.474 | -0.199 | -0.104 |
| -0.599999999999997 | -0.474 | -0.199 | -0.105 |
| -0.595999999999997 | -0.475 | -0.2 | -0.105 |
| -0.591999999999997 | -0.476 | -0.2 | -0.105 |
| -0.587999999999997 | -0.476 | -0.201 | -0.106 |
| -0.583999999999997 | -0.477 | -0.201 | -0.106 |
| -0.579999999999997 | -0.477 | -0.202 | -0.107 |
| -0.575999999999997 | -0.478 | -0.202 | -0.107 |
| -0.571999999999997 | -0.478 | -0.203 | -0.107 |
| -0.567999999999997 | -0.479 | -0.203 | -0.108 |
| -0.563999999999997 | -0.479 | -0.204 | -0.108 |
| -0.559999999999997 | -0.48 | -0.204 | -0.109 |
| -0.555999999999997 | -0.481 | -0.205 | -0.109 |
| -0.551999999999997 | -0.481 | -0.205 | -0.109 |
| -0.547999999999997 | -0.481 | -0.205 | -0.11 |
| -0.543999999999997 | -0.482 | -0.206 | -0.11 |
| -0.539999999999997 | -0.482 | -0.206 | -0.11 |
| -0.535999999999997 | -0.483 | -0.207 | -0.111 |
| -0.531999999999997 | -0.483 | -0.207 | -0.111 |
| -0.527999999999997 | -0.484 | -0.207 | -0.111 |
| -0.523999999999997 | -0.484 | -0.208 | -0.112 |
| -0.519999999999997 | -0.485 | -0.208 | -0.112 |
| -0.515999999999997 | -0.485 | -0.209 | -0.112 |
| -0.511999999999997 | -0.486 | -0.209 | -0.113 |
| -0.507999999999997 | -0.486 | -0.209 | -0.113 |
| -0.503999999999997 | -0.486 | -0.21 | -0.113 |
| -0.499999999999997 | -0.487 | -0.21 | -0.114 |
| -0.495999999999997 | -0.487 | -0.21 | -0.114 |
| -0.491999999999997 | -0.488 | -0.211 | -0.114 |
| -0.487999999999997 | -0.488 | -0.211 | -0.115 |
| -0.483999999999997 | -0.488 | -0.211 | -0.115 |
| -0.479999999999997 | -0.489 | -0.212 | -0.115 |
| -0.475999999999997 | -0.489 | -0.212 | -0.115 |
| -0.471999999999997 | -0.489 | -0.212 | -0.116 |
| -0.467999999999997 | -0.49 | -0.213 | -0.116 |
| -0.463999999999997 | -0.49 | -0.213 | -0.116 |
| -0.459999999999997 | -0.49 | -0.213 | -0.117 |
| -0.455999999999997 | -0.491 | -0.213 | -0.117 |
| -0.451999999999997 | -0.491 | -0.214 | -0.117 |
| -0.447999999999997 | -0.491 | -0.214 | -0.117 |
| -0.443999999999997 | -0.491 | -0.214 | -0.117 |
| -0.439999999999997 | -0.492 | -0.214 | -0.118 |
| -0.435999999999997 | -0.492 | -0.215 | -0.118 |
| -0.431999999999997 | -0.492 | -0.215 | -0.118 |
| -0.427999999999997 | -0.493 | -0.215 | -0.118 |
| -0.423999999999997 | -0.493 | -0.215 | -0.119 |
| -0.419999999999997 | -0.493 | -0.216 | -0.119 |
| -0.415999999999997 | -0.493 | -0.216 | -0.119 |
| -0.411999999999997 | -0.494 | -0.216 | -0.119 |
| -0.407999999999997 | -0.494 | -0.216 | -0.119 |
| -0.403999999999997 | -0.494 | -0.217 | -0.12 |
| -0.399999999999997 | -0.494 | -0.217 | -0.12 |
| -0.395999999999997 | -0.494 | -0.217 | -0.12 |
| -0.391999999999997 | -0.495 | -0.217 | -0.12 |
| -0.387999999999997 | -0.495 | -0.217 | -0.12 |
| -0.383999999999997 | -0.495 | -0.218 | -0.121 |
| -0.379999999999997 | -0.495 | -0.218 | -0.121 |
| -0.375999999999997 | -0.495 | -0.218 | -0.121 |
| -0.371999999999997 | -0.496 | -0.218 | -0.121 |
| -0.367999999999997 | -0.496 | -0.218 | -0.121 |
| -0.363999999999997 | -0.496 | -0.218 | -0.121 |
| -0.359999999999997 | -0.496 | -0.219 | -0.121 |
| -0.355999999999997 | -0.496 | -0.219 | -0.122 |
| -0.351999999999997 | -0.496 | -0.219 | -0.122 |
| -0.347999999999997 | -0.497 | -0.219 | -0.122 |
| -0.343999999999997 | -0.497 | -0.219 | -0.122 |
| -0.339999999999997 | -0.497 | -0.219 | -0.122 |
| -0.335999999999997 | -0.497 | -0.219 | -0.122 |
| -0.331999999999997 | -0.497 | -0.219 | -0.122 |
| -0.327999999999997 | -0.497 | -0.22 | -0.122 |
| -0.323999999999997 | -0.497 | -0.22 | -0.123 |
| -0.319999999999997 | -0.498 | -0.22 | -0.123 |
| -0.315999999999997 | -0.498 | -0.22 | -0.123 |
| -0.311999999999997 | -0.498 | -0.22 | -0.123 |
| -0.307999999999997 | -0.498 | -0.22 | -0.123 |
| -0.303999999999997 | -0.498 | -0.22 | -0.123 |
| -0.299999999999997 | -0.498 | -0.22 | -0.123 |
| -0.295999999999997 | -0.498 | -0.22 | -0.123 |
| -0.291999999999997 | -0.498 | -0.221 | -0.123 |
| -0.287999999999997 | -0.498 | -0.221 | -0.123 |
| -0.283999999999997 | -0.498 | -0.221 | -0.124 |
| -0.279999999999997 | -0.499 | -0.221 | -0.124 |
| -0.275999999999997 | -0.499 | -0.221 | -0.124 |
| -0.271999999999997 | -0.499 | -0.221 | -0.124 |
| -0.267999999999997 | -0.499 | -0.221 | -0.124 |
| -0.263999999999997 | -0.499 | -0.221 | -0.124 |
| -0.259999999999997 | -0.499 | -0.221 | -0.124 |
| -0.255999999999997 | -0.499 | -0.221 | -0.124 |
| -0.251999999999997 | -0.499 | -0.221 | -0.124 |
| -0.247999999999997 | -0.499 | -0.221 | -0.124 |
| -0.243999999999997 | -0.499 | -0.221 | -0.124 |
| -0.239999999999997 | -0.499 | -0.221 | -0.124 |
| -0.235999999999997 | -0.499 | -0.221 | -0.124 |
| -0.231999999999997 | -0.499 | -0.222 | -0.124 |
| -0.227999999999997 | -0.499 | -0.222 | -0.124 |
| -0.223999999999997 | -0.499 | -0.222 | -0.124 |
| -0.219999999999997 | -0.499 | -0.222 | -0.124 |
| -0.215999999999997 | -0.499 | -0.222 | -0.124 |
| -0.211999999999997 | -0.5 | -0.222 | -0.125 |
| -0.207999999999997 | -0.5 | -0.222 | -0.125 |
| -0.203999999999997 | -0.5 | -0.222 | -0.125 |
| -0.199999999999997 | -0.5 | -0.222 | -0.125 |
| -0.195999999999997 | -0.5 | -0.222 | -0.125 |
| -0.191999999999997 | -0.5 | -0.222 | -0.125 |
| -0.187999999999997 | -0.5 | -0.222 | -0.125 |
| -0.183999999999997 | -0.5 | -0.222 | -0.125 |
| -0.179999999999997 | -0.5 | -0.222 | -0.125 |
| -0.175999999999997 | -0.5 | -0.222 | -0.125 |
| -0.171999999999997 | -0.5 | -0.222 | -0.125 |
| -0.167999999999997 | -0.5 | -0.222 | -0.125 |
| -0.163999999999997 | -0.5 | -0.222 | -0.125 |
| -0.159999999999997 | -0.5 | -0.222 | -0.125 |
| -0.155999999999997 | -0.5 | -0.222 | -0.125 |
| -0.151999999999997 | -0.5 | -0.222 | -0.125 |
| -0.147999999999997 | -0.5 | -0.222 | -0.125 |
| -0.143999999999997 | -0.5 | -0.222 | -0.125 |
| -0.139999999999997 | -0.5 | -0.222 | -0.125 |
| -0.135999999999997 | -0.5 | -0.222 | -0.125 |
| -0.131999999999997 | -0.5 | -0.222 | -0.125 |
| -0.127999999999997 | -0.5 | -0.222 | -0.125 |
| -0.123999999999997 | -0.5 | -0.222 | -0.125 |
| -0.119999999999997 | -0.5 | -0.222 | -0.125 |
| -0.115999999999997 | -0.5 | -0.222 | -0.125 |
| -0.111999999999997 | -0.5 | -0.222 | -0.125 |
| -0.107999999999997 | -0.5 | -0.222 | -0.125 |
| -0.103999999999997 | -0.5 | -0.222 | -0.125 |
| -0.0999999999999965 | -0.5 | -0.222 | -0.125 |
| -0.0959999999999965 | -0.5 | -0.222 | -0.125 |
| -0.0919999999999965 | -0.5 | -0.222 | -0.125 |
| -0.0879999999999965 | -0.5 | -0.222 | -0.125 |
| -0.0839999999999965 | -0.5 | -0.222 | -0.125 |
| -0.0799999999999965 | -0.5 | -0.222 | -0.125 |
| -0.0759999999999965 | -0.5 | -0.222 | -0.125 |
| -0.0719999999999965 | -0.5 | -0.222 | -0.125 |
| -0.0679999999999965 | -0.5 | -0.222 | -0.125 |
| -0.0639999999999965 | -0.5 | -0.222 | -0.125 |
| -0.0599999999999965 | -0.5 | -0.222 | -0.125 |
| -0.0559999999999965 | -0.5 | -0.222 | -0.125 |
| -0.0519999999999965 | -0.5 | -0.222 | -0.125 |
| -0.0479999999999965 | -0.5 | -0.222 | -0.125 |
| -0.0439999999999965 | -0.5 | -0.222 | -0.125 |
| -0.0399999999999965 | -0.5 | -0.222 | -0.125 |
| -0.0359999999999965 | -0.5 | -0.222 | -0.125 |
| -0.0319999999999965 | -0.5 | -0.222 | -0.125 |
| -0.0279999999999965 | -0.5 | -0.222 | -0.125 |
| -0.0239999999999965 | -0.5 | -0.222 | -0.125 |
| -0.0199999999999965 | -0.5 | -0.222 | -0.125 |
| -0.0159999999999965 | -0.5 | -0.222 | -0.125 |
| -0.0119999999999965 | -0.5 | -0.222 | -0.125 |
| -0.00799999999999647 | -0.5 | -0.222 | -0.125 |
| -0.00399999999999647 | -0.5 | -0.222 | -0.125 |
| 3.52495810318487e-15 | -0.5 | -0.222 | -0.125 |
| 0.00400000000000352 | -0.5 | -0.222 | -0.125 |
| 0.00800000000000352 | -0.5 | -0.222 | -0.125 |
| 0.0120000000000035 | -0.5 | -0.222 | -0.125 |
| 0.0160000000000035 | -0.5 | -0.222 | -0.125 |
| 0.0200000000000035 | -0.5 | -0.222 | -0.125 |
| 0.0240000000000035 | -0.5 | -0.222 | -0.125 |
| 0.0280000000000035 | -0.5 | -0.222 | -0.125 |
| 0.0320000000000035 | -0.5 | -0.222 | -0.125 |
| 0.0360000000000035 | -0.5 | -0.222 | -0.125 |
| 0.0400000000000035 | -0.5 | -0.222 | -0.125 |
| 0.0440000000000035 | -0.5 | -0.222 | -0.125 |
| 0.0480000000000035 | -0.5 | -0.222 | -0.125 |
| 0.0520000000000035 | -0.5 | -0.222 | -0.125 |
| 0.0560000000000035 | -0.5 | -0.222 | -0.125 |
| 0.0600000000000035 | -0.5 | -0.222 | -0.125 |
| 0.0640000000000035 | -0.5 | -0.222 | -0.125 |
| 0.0680000000000035 | -0.5 | -0.222 | -0.125 |
| 0.0720000000000036 | -0.5 | -0.222 | -0.125 |
| 0.0760000000000036 | -0.5 | -0.222 | -0.125 |
| 0.0800000000000036 | -0.5 | -0.222 | -0.125 |
| 0.0840000000000036 | -0.5 | -0.222 | -0.125 |
| 0.0880000000000036 | -0.5 | -0.222 | -0.125 |
| 0.0920000000000036 | -0.5 | -0.222 | -0.125 |
| 0.0960000000000036 | -0.5 | -0.222 | -0.125 |
| 0.100000000000004 | -0.5 | -0.222 | -0.125 |
| 0.104000000000004 | -0.5 | -0.222 | -0.125 |
| 0.108000000000004 | -0.5 | -0.222 | -0.125 |
| 0.112000000000004 | -0.5 | -0.222 | -0.125 |
| 0.116000000000004 | -0.5 | -0.222 | -0.125 |
| 0.120000000000004 | -0.5 | -0.222 | -0.125 |
| 0.124000000000004 | -0.5 | -0.222 | -0.125 |
| 0.128000000000004 | -0.5 | -0.222 | -0.125 |
| 0.132000000000004 | -0.5 | -0.222 | -0.125 |
| 0.136000000000004 | -0.5 | -0.222 | -0.125 |
| 0.140000000000004 | -0.5 | -0.222 | -0.125 |
| 0.144000000000004 | -0.5 | -0.222 | -0.125 |
| 0.148000000000004 | -0.5 | -0.222 | -0.125 |
| 0.152000000000004 | -0.5 | -0.222 | -0.125 |
| 0.156000000000004 | -0.5 | -0.222 | -0.125 |
| 0.160000000000004 | -0.5 | -0.222 | -0.125 |
| 0.164000000000004 | -0.5 | -0.222 | -0.125 |
| 0.168000000000004 | -0.5 | -0.222 | -0.125 |
| 0.172000000000004 | -0.5 | -0.222 | -0.125 |
| 0.176000000000004 | -0.5 | -0.222 | -0.125 |
| 0.180000000000004 | -0.5 | -0.222 | -0.125 |
| 0.184000000000004 | -0.5 | -0.222 | -0.125 |
| 0.188000000000004 | -0.5 | -0.222 | -0.125 |
| 0.192000000000004 | -0.5 | -0.222 | -0.125 |
| 0.196000000000004 | -0.5 | -0.222 | -0.125 |
| 0.200000000000004 | -0.5 | -0.222 | -0.125 |
| 0.204000000000004 | -0.5 | -0.222 | -0.125 |
| 0.208000000000004 | -0.5 | -0.222 | -0.125 |
| 0.212000000000004 | -0.5 | -0.222 | -0.125 |
| 0.216000000000004 | -0.499 | -0.222 | -0.124 |
| 0.220000000000004 | -0.499 | -0.222 | -0.124 |
| 0.224000000000004 | -0.499 | -0.222 | -0.124 |
| 0.228000000000004 | -0.499 | -0.222 | -0.124 |
| 0.232000000000004 | -0.499 | -0.222 | -0.124 |
| 0.236000000000004 | -0.499 | -0.221 | -0.124 |
| 0.240000000000004 | -0.499 | -0.221 | -0.124 |
| 0.244000000000004 | -0.499 | -0.221 | -0.124 |
| 0.248000000000004 | -0.499 | -0.221 | -0.124 |
| 0.252000000000004 | -0.499 | -0.221 | -0.124 |
| 0.256000000000004 | -0.499 | -0.221 | -0.124 |
| 0.260000000000004 | -0.499 | -0.221 | -0.124 |
| 0.264000000000004 | -0.499 | -0.221 | -0.124 |
| 0.268000000000004 | -0.499 | -0.221 | -0.124 |
| 0.272000000000004 | -0.499 | -0.221 | -0.124 |
| 0.276000000000004 | -0.499 | -0.221 | -0.124 |
| 0.280000000000004 | -0.499 | -0.221 | -0.124 |
| 0.284000000000004 | -0.498 | -0.221 | -0.124 |
| 0.288000000000004 | -0.498 | -0.221 | -0.123 |
| 0.292000000000004 | -0.498 | -0.221 | -0.123 |
| 0.296000000000004 | -0.498 | -0.22 | -0.123 |
| 0.300000000000004 | -0.498 | -0.22 | -0.123 |
| 0.304000000000004 | -0.498 | -0.22 | -0.123 |
| 0.308000000000004 | -0.498 | -0.22 | -0.123 |
| 0.312000000000004 | -0.498 | -0.22 | -0.123 |
| 0.316000000000004 | -0.498 | -0.22 | -0.123 |
| 0.320000000000004 | -0.498 | -0.22 | -0.123 |
| 0.324000000000004 | -0.497 | -0.22 | -0.123 |
| 0.328000000000004 | -0.497 | -0.22 | -0.122 |
| 0.332000000000004 | -0.497 | -0.219 | -0.122 |
| 0.336000000000004 | -0.497 | -0.219 | -0.122 |
| 0.340000000000004 | -0.497 | -0.219 | -0.122 |
| 0.344000000000004 | -0.497 | -0.219 | -0.122 |
| 0.348000000000004 | -0.497 | -0.219 | -0.122 |
| 0.352000000000004 | -0.496 | -0.219 | -0.122 |
| 0.356000000000004 | -0.496 | -0.219 | -0.122 |
| 0.360000000000004 | -0.496 | -0.219 | -0.121 |
| 0.364000000000004 | -0.496 | -0.218 | -0.121 |
| 0.368000000000004 | -0.496 | -0.218 | -0.121 |
| 0.372000000000004 | -0.496 | -0.218 | -0.121 |
| 0.376000000000004 | -0.495 | -0.218 | -0.121 |
| 0.380000000000004 | -0.495 | -0.218 | -0.121 |
| 0.384000000000004 | -0.495 | -0.218 | -0.121 |
| 0.388000000000004 | -0.495 | -0.217 | -0.12 |
| 0.392000000000004 | -0.495 | -0.217 | -0.12 |
| 0.396000000000004 | -0.494 | -0.217 | -0.12 |
| 0.400000000000004 | -0.494 | -0.217 | -0.12 |
| 0.404000000000004 | -0.494 | -0.217 | -0.12 |
| 0.408000000000004 | -0.494 | -0.216 | -0.119 |
| 0.412000000000004 | -0.494 | -0.216 | -0.119 |
| 0.416000000000004 | -0.493 | -0.216 | -0.119 |
| 0.420000000000004 | -0.493 | -0.216 | -0.119 |
| 0.424000000000004 | -0.493 | -0.215 | -0.119 |
| 0.428000000000004 | -0.493 | -0.215 | -0.118 |
| 0.432000000000004 | -0.492 | -0.215 | -0.118 |
| 0.436000000000004 | -0.492 | -0.215 | -0.118 |
| 0.440000000000004 | -0.492 | -0.214 | -0.118 |
| 0.444000000000004 | -0.491 | -0.214 | -0.117 |
| 0.448000000000004 | -0.491 | -0.214 | -0.117 |
| 0.452000000000004 | -0.491 | -0.214 | -0.117 |
| 0.456000000000004 | -0.491 | -0.213 | -0.117 |
| 0.460000000000004 | -0.49 | -0.213 | -0.117 |
| 0.464000000000004 | -0.49 | -0.213 | -0.116 |
| 0.468000000000004 | -0.49 | -0.213 | -0.116 |
| 0.472000000000004 | -0.489 | -0.212 | -0.116 |
| 0.476000000000004 | -0.489 | -0.212 | -0.115 |
| 0.480000000000004 | -0.489 | -0.212 | -0.115 |
| 0.484000000000004 | -0.488 | -0.211 | -0.115 |
| 0.488000000000004 | -0.488 | -0.211 | -0.115 |
| 0.492000000000004 | -0.488 | -0.211 | -0.114 |
| 0.496000000000004 | -0.487 | -0.21 | -0.114 |
| 0.500000000000004 | -0.487 | -0.21 | -0.114 |
| 0.504000000000004 | -0.486 | -0.21 | -0.113 |
| 0.508000000000004 | -0.486 | -0.209 | -0.113 |
| 0.512000000000004 | -0.486 | -0.209 | -0.113 |
| 0.516000000000004 | -0.485 | -0.209 | -0.112 |
| 0.520000000000004 | -0.485 | -0.208 | -0.112 |
| 0.524000000000004 | -0.484 | -0.208 | -0.112 |
| 0.528000000000004 | -0.484 | -0.207 | -0.111 |
| 0.532000000000004 | -0.483 | -0.207 | -0.111 |
| 0.536000000000004 | -0.483 | -0.207 | -0.111 |
| 0.540000000000004 | -0.482 | -0.206 | -0.11 |
| 0.544000000000004 | -0.482 | -0.206 | -0.11 |
| 0.548000000000004 | -0.481 | -0.205 | -0.11 |
| 0.552000000000004 | -0.481 | -0.205 | -0.109 |
| 0.556000000000004 | -0.481 | -0.205 | -0.109 |
| 0.560000000000004 | -0.48 | -0.204 | -0.109 |
| 0.564000000000004 | -0.479 | -0.204 | -0.108 |
| 0.568000000000004 | -0.479 | -0.203 | -0.108 |
| 0.572000000000004 | -0.478 | -0.203 | -0.107 |
| 0.576000000000004 | -0.478 | -0.202 | -0.107 |
| 0.580000000000004 | -0.477 | -0.202 | -0.107 |
| 0.584000000000004 | -0.477 | -0.201 | -0.106 |
| 0.588000000000004 | -0.476 | -0.201 | -0.106 |
| 0.592000000000004 | -0.476 | -0.2 | -0.105 |
| 0.596000000000004 | -0.475 | -0.2 | -0.105 |
| 0.600000000000004 | -0.474 | -0.199 | -0.105 |
| 0.604000000000004 | -0.474 | -0.199 | -0.104 |
| 0.608000000000004 | -0.473 | -0.198 | -0.104 |
| 0.612000000000004 | -0.473 | -0.198 | -0.103 |
| 0.616000000000004 | -0.472 | -0.197 | -0.103 |
| 0.620000000000004 | -0.471 | -0.197 | -0.102 |
| 0.624000000000004 | -0.471 | -0.196 | -0.102 |
| 0.628000000000004 | -0.47 | -0.196 | -0.102 |
| 0.632000000000004 | -0.469 | -0.195 | -0.101 |
| 0.636000000000004 | -0.469 | -0.195 | -0.101 |
| 0.640000000000004 | -0.468 | -0.194 | -0.1 |
| 0.644000000000004 | -0.467 | -0.194 | -0.1 |
| 0.648000000000004 | -0.467 | -0.193 | -0.099 |
| 0.652000000000004 | -0.466 | -0.192 | -0.099 |
| 0.656000000000004 | -0.465 | -0.192 | -0.098 |
| 0.660000000000004 | -0.464 | -0.191 | -0.098 |
| 0.664000000000004 | -0.464 | -0.191 | -0.097 |
| 0.668000000000004 | -0.463 | -0.19 | -0.097 |
| 0.672000000000004 | -0.462 | -0.189 | -0.096 |
| 0.676000000000004 | -0.461 | -0.189 | -0.096 |
| 0.680000000000004 | -0.46 | -0.188 | -0.095 |
| 0.684000000000004 | -0.46 | -0.187 | -0.095 |
| 0.688000000000004 | -0.459 | -0.187 | -0.094 |
| 0.692000000000004 | -0.458 | -0.186 | -0.094 |
| 0.696000000000004 | -0.457 | -0.186 | -0.093 |
| 0.700000000000004 | -0.456 | -0.185 | -0.093 |
| 0.704000000000004 | -0.456 | -0.184 | -0.092 |
| 0.708000000000004 | -0.455 | -0.184 | -0.092 |
| 0.712000000000004 | -0.454 | -0.183 | -0.091 |
| 0.716000000000004 | -0.453 | -0.182 | -0.091 |
| 0.720000000000004 | -0.452 | -0.182 | -0.09 |
| 0.724000000000004 | -0.451 | -0.181 | -0.09 |
| 0.728000000000004 | -0.45 | -0.18 | -0.089 |
| 0.732000000000004 | -0.449 | -0.179 | -0.089 |
| 0.736000000000004 | -0.448 | -0.179 | -0.088 |
| 0.740000000000004 | -0.448 | -0.178 | -0.088 |
| 0.744000000000004 | -0.447 | -0.177 | -0.087 |
| 0.748000000000004 | -0.446 | -0.177 | -0.087 |
| 0.752000000000004 | -0.445 | -0.176 | -0.086 |
| 0.756000000000004 | -0.444 | -0.175 | -0.085 |
| 0.760000000000004 | -0.443 | -0.174 | -0.085 |
| 0.764000000000004 | -0.442 | -0.174 | -0.084 |
| 0.768000000000004 | -0.441 | -0.173 | -0.084 |
| 0.772000000000004 | -0.44 | -0.172 | -0.083 |
| 0.776000000000004 | -0.439 | -0.171 | -0.083 |
| 0.780000000000004 | -0.438 | -0.171 | -0.082 |
| 0.784000000000004 | -0.437 | -0.17 | -0.082 |
| 0.788000000000004 | -0.436 | -0.169 | -0.081 |
| 0.792000000000004 | -0.435 | -0.168 | -0.08 |
| 0.796000000000004 | -0.433 | -0.168 | -0.08 |
| 0.800000000000004 | -0.432 | -0.167 | -0.079 |
| 0.804000000000004 | -0.431 | -0.166 | -0.079 |
| 0.808000000000004 | -0.43 | -0.165 | -0.078 |
| 0.812000000000004 | -0.429 | -0.164 | -0.078 |
| 0.816000000000004 | -0.428 | -0.164 | -0.077 |
| 0.820000000000004 | -0.427 | -0.163 | -0.076 |
| 0.824000000000004 | -0.426 | -0.162 | -0.076 |
| 0.828000000000004 | -0.425 | -0.161 | -0.075 |
| 0.832000000000004 | -0.423 | -0.16 | -0.075 |
| 0.836000000000004 | -0.422 | -0.16 | -0.074 |
| 0.840000000000004 | -0.421 | -0.159 | -0.073 |
| 0.844000000000004 | -0.42 | -0.158 | -0.073 |
| 0.848000000000004 | -0.419 | -0.157 | -0.072 |
| 0.852000000000004 | -0.418 | -0.156 | -0.072 |
| 0.856000000000004 | -0.416 | -0.155 | -0.071 |
| 0.860000000000004 | -0.415 | -0.155 | -0.071 |
| 0.864000000000004 | -0.414 | -0.154 | -0.07 |
| 0.868000000000004 | -0.413 | -0.153 | -0.069 |
| 0.872000000000004 | -0.411 | -0.152 | -0.069 |
| 0.876000000000004 | -0.41 | -0.151 | -0.068 |
| 0.880000000000004 | -0.409 | -0.15 | -0.068 |
| 0.884000000000004 | -0.408 | -0.149 | -0.067 |
| 0.888000000000004 | -0.406 | -0.149 | -0.067 |
| 0.892000000000004 | -0.405 | -0.148 | -0.066 |
| 0.896000000000004 | -0.404 | -0.147 | -0.065 |
| 0.900000000000004 | -0.403 | -0.146 | -0.065 |
| 0.904000000000004 | -0.401 | -0.145 | -0.064 |
| 0.908000000000004 | -0.4 | -0.144 | -0.064 |
| 0.912000000000004 | -0.399 | -0.143 | -0.063 |
| 0.916000000000004 | -0.397 | -0.143 | -0.063 |
| 0.920000000000004 | -0.396 | -0.142 | -0.062 |
| 0.924000000000004 | -0.395 | -0.141 | -0.061 |
| 0.928000000000004 | -0.393 | -0.14 | -0.061 |
| 0.932000000000004 | -0.392 | -0.139 | -0.06 |
| 0.936000000000004 | -0.391 | -0.138 | -0.06 |
| 0.940000000000004 | -0.389 | -0.137 | -0.059 |
| 0.944000000000004 | -0.388 | -0.136 | -0.059 |
| 0.948000000000004 | -0.386 | -0.136 | -0.058 |
| 0.952000000000004 | -0.385 | -0.135 | -0.057 |
| 0.956000000000004 | -0.384 | -0.134 | -0.057 |
| 0.960000000000004 | -0.382 | -0.133 | -0.056 |
| 0.964000000000004 | -0.381 | -0.132 | -0.056 |
| 0.968000000000004 | -0.379 | -0.131 | -0.055 |
| 0.972000000000004 | -0.378 | -0.13 | -0.055 |
| 0.976000000000004 | -0.377 | -0.129 | -0.054 |
| 0.980000000000004 | -0.375 | -0.128 | -0.053 |
| 0.984000000000004 | -0.374 | -0.128 | -0.053 |
| 0.988000000000004 | -0.372 | -0.127 | -0.052 |
| 0.992000000000004 | -0.371 | -0.126 | -0.052 |
| 0.996000000000004 | -0.369 | -0.125 | -0.051 |
| 1.000000000000004 | -0.368 | -0.124 | -0.051 |
| 1.004000000000004 | -0.366 | -0.123 | -0.05 |
| 1.008000000000004 | -0.365 | -0.122 | -0.05 |
| 1.012000000000004 | -0.363 | -0.121 | -0.049 |
| 1.016000000000004 | -0.362 | -0.12 | -0.049 |
| 1.020000000000004 | -0.36 | -0.12 | -0.048 |
| 1.024000000000004 | -0.359 | -0.119 | -0.048 |
| 1.028000000000004 | -0.357 | -0.118 | -0.047 |
| 1.032000000000004 | -0.356 | -0.117 | -0.046 |
| 1.036000000000004 | -0.354 | -0.116 | -0.046 |
| 1.040000000000004 | -0.353 | -0.115 | -0.045 |
| 1.044000000000004 | -0.351 | -0.114 | -0.045 |
| 1.048000000000004 | -0.35 | -0.113 | -0.044 |
| 1.052000000000004 | -0.348 | -0.112 | -0.044 |
| 1.056000000000004 | -0.347 | -0.112 | -0.043 |
| 1.060000000000004 | -0.345 | -0.111 | -0.043 |
| 1.064000000000004 | -0.344 | -0.11 | -0.042 |
| 1.068000000000004 | -0.342 | -0.109 | -0.042 |
| 1.072000000000004 | -0.341 | -0.108 | -0.041 |
| 1.076000000000004 | -0.339 | -0.107 | -0.041 |
| 1.080000000000004 | -0.337 | -0.106 | -0.04 |
| 1.084000000000004 | -0.336 | -0.105 | -0.04 |
| 1.088000000000004 | -0.334 | -0.104 | -0.039 |
| 1.092000000000004 | -0.333 | -0.104 | -0.039 |
| 1.096000000000004 | -0.331 | -0.103 | -0.038 |
| 1.100000000000004 | -0.33 | -0.102 | -0.038 |
| 1.104000000000004 | -0.328 | -0.101 | -0.038 |
| 1.108000000000004 | -0.326 | -0.1 | -0.037 |
| 1.112000000000004 | -0.325 | -0.099 | -0.037 |
| 1.116000000000004 | -0.323 | -0.098 | -0.036 |
| 1.120000000000004 | -0.322 | -0.098 | -0.036 |
| 1.124000000000004 | -0.32 | -0.097 | -0.035 |
| 1.128000000000004 | -0.318 | -0.096 | -0.035 |
| 1.132000000000004 | -0.317 | -0.095 | -0.034 |
| 1.136000000000004 | -0.315 | -0.094 | -0.034 |
| 1.140000000000004 | -0.313 | -0.093 | -0.033 |
| 1.144000000000004 | -0.312 | -0.092 | -0.033 |
| 1.148000000000004 | -0.31 | -0.092 | -0.033 |
| 1.152000000000004 | -0.309 | -0.091 | -0.032 |
| 1.156000000000004 | -0.307 | -0.09 | -0.032 |
| 1.160000000000004 | -0.305 | -0.089 | -0.031 |
| 1.164000000000004 | -0.304 | -0.088 | -0.031 |
| 1.168000000000004 | -0.302 | -0.087 | -0.03 |
| 1.172000000000004 | -0.3 | -0.087 | -0.03 |
| 1.176000000000004 | -0.299 | -0.086 | -0.03 |
| 1.180000000000004 | -0.297 | -0.085 | -0.029 |
| 1.184000000000004 | -0.296 | -0.084 | -0.029 |
| 1.188000000000004 | -0.294 | -0.083 | -0.028 |
| 1.192000000000004 | -0.292 | -0.083 | -0.028 |
| 1.196000000000004 | -0.291 | -0.082 | -0.028 |
| 1.200000000000004 | -0.289 | -0.081 | -0.027 |
| 1.204000000000004 | -0.287 | -0.08 | -0.027 |
| 1.208000000000004 | -0.286 | -0.079 | -0.026 |
| 1.212000000000004 | -0.284 | -0.079 | -0.026 |
| 1.216000000000004 | -0.282 | -0.078 | -0.026 |
| 1.220000000000004 | -0.281 | -0.077 | -0.025 |
| 1.224000000000004 | -0.279 | -0.076 | -0.025 |
| 1.228000000000004 | -0.278 | -0.075 | -0.025 |
| 1.232000000000004 | -0.276 | -0.075 | -0.024 |
| 1.236000000000004 | -0.274 | -0.074 | -0.024 |
| 1.240000000000004 | -0.273 | -0.073 | -0.024 |
| 1.244000000000004 | -0.271 | -0.072 | -0.023 |
| 1.248000000000004 | -0.269 | -0.072 | -0.023 |
| 1.252000000000004 | -0.268 | -0.071 | -0.022 |
| 1.256000000000004 | -0.266 | -0.07 | -0.022 |
| 1.260000000000004 | -0.264 | -0.069 | -0.022 |
| 1.264000000000004 | -0.263 | -0.069 | -0.021 |
| 1.268000000000004 | -0.261 | -0.068 | -0.021 |
| 1.272000000000004 | -0.26 | -0.067 | -0.021 |
| 1.276000000000004 | -0.258 | -0.067 | -0.02 |
| 1.280000000000004 | -0.256 | -0.066 | -0.02 |
| 1.284000000000004 | -0.255 | -0.065 | -0.02 |
| 1.288000000000004 | -0.253 | -0.064 | -0.02 |
| 1.292000000000004 | -0.251 | -0.064 | -0.019 |
| 1.296000000000004 | -0.25 | -0.063 | -0.019 |
| 1.300000000000004 | -0.248 | -0.062 | -0.019 |
| 1.304000000000004 | -0.247 | -0.062 | -0.018 |
| 1.308000000000004 | -0.245 | -0.061 | -0.018 |
| 1.312000000000004 | -0.243 | -0.06 | -0.018 |
| 1.316000000000004 | -0.242 | -0.06 | -0.017 |
| 1.320000000000004 | -0.24 | -0.059 | -0.017 |
| 1.324000000000004 | -0.238 | -0.058 | -0.017 |
| 1.328000000000004 | -0.237 | -0.057 | -0.017 |
| 1.332000000000004 | -0.235 | -0.057 | -0.016 |
| 1.336000000000004 | -0.234 | -0.056 | -0.016 |
| 1.340000000000004 | -0.232 | -0.056 | -0.016 |
| 1.344000000000004 | -0.23 | -0.055 | -0.016 |
| 1.348000000000004 | -0.229 | -0.054 | -0.015 |
| 1.352000000000004 | -0.227 | -0.054 | -0.015 |
| 1.356000000000004 | -0.226 | -0.053 | -0.015 |
| 1.360000000000004 | -0.224 | -0.052 | -0.015 |
| 1.364000000000004 | -0.223 | -0.052 | -0.014 |
| 1.368000000000004 | -0.221 | -0.051 | -0.014 |
| 1.372000000000004 | -0.219 | -0.05 | -0.014 |
| 1.376000000000004 | -0.218 | -0.05 | -0.014 |
| 1.380000000000004 | -0.216 | -0.049 | -0.013 |
| 1.384000000000004 | -0.215 | -0.049 | -0.013 |
| 1.388000000000005 | -0.213 | -0.048 | -0.013 |
| 1.392000000000004 | -0.212 | -0.047 | -0.013 |
| 1.396000000000004 | -0.21 | -0.047 | -0.012 |
| 1.400000000000005 | -0.208 | -0.046 | -0.012 |
| 1.404000000000005 | -0.207 | -0.046 | -0.012 |
| 1.408000000000005 | -0.205 | -0.045 | -0.012 |
| 1.412000000000005 | -0.204 | -0.045 | -0.012 |
| 1.416000000000005 | -0.202 | -0.044 | -0.011 |
| 1.420000000000005 | -0.201 | -0.043 | -0.011 |
| 1.424000000000005 | -0.199 | -0.043 | -0.011 |
| 1.428000000000005 | -0.198 | -0.042 | -0.011 |
| 1.432000000000005 | -0.196 | -0.042 | -0.011 |
| 1.436000000000005 | -0.195 | -0.041 | -0.01 |
| 1.440000000000005 | -0.193 | -0.041 | -0.01 |
| 1.444000000000005 | -0.192 | -0.04 | -0.01 |
| 1.448000000000005 | -0.19 | -0.04 | -0.01 |
| 1.452000000000005 | -0.189 | -0.039 | -0.01 |
| 1.456000000000005 | -0.187 | -0.039 | -0.009 |
| 1.460000000000005 | -0.186 | -0.038 | -0.009 |
| 1.464000000000005 | -0.184 | -0.038 | -0.009 |
| 1.468000000000005 | -0.183 | -0.037 | -0.009 |
| 1.472000000000005 | -0.181 | -0.037 | -0.009 |
| 1.476000000000005 | -0.18 | -0.036 | -0.009 |
| 1.480000000000005 | -0.178 | -0.036 | -0.008 |
| 1.484000000000005 | -0.177 | -0.035 | -0.008 |
| 1.488000000000005 | -0.176 | -0.035 | -0.008 |
| 1.492000000000005 | -0.174 | -0.034 | -0.008 |
| 1.496000000000005 | -0.173 | -0.034 | -0.008 |
| 1.500000000000005 | -0.171 | -0.033 | -0.008 |
| 1.504000000000005 | -0.17 | -0.033 | -0.007 |
| 1.508000000000005 | -0.168 | -0.032 | -0.007 |
| 1.512000000000005 | -0.167 | -0.032 | -0.007 |
| 1.516000000000005 | -0.166 | -0.031 | -0.007 |
| 1.520000000000005 | -0.164 | -0.031 | -0.007 |
| 1.524000000000005 | -0.163 | -0.031 | -0.007 |
| 1.528000000000005 | -0.161 | -0.03 | -0.007 |
| 1.532000000000005 | -0.16 | -0.03 | -0.007 |
| 1.536000000000005 | -0.159 | -0.029 | -0.006 |
| 1.540000000000005 | -0.157 | -0.029 | -0.006 |
| 1.544000000000005 | -0.156 | -0.028 | -0.006 |
| 1.548000000000005 | -0.155 | -0.028 | -0.006 |
| 1.552000000000005 | -0.153 | -0.028 | -0.006 |
| 1.556000000000005 | -0.152 | -0.027 | -0.006 |
| 1.560000000000005 | -0.151 | -0.027 | -0.006 |
| 1.564000000000005 | -0.149 | -0.026 | -0.006 |
| 1.568000000000005 | -0.148 | -0.026 | -0.005 |
| 1.572000000000005 | -0.147 | -0.026 | -0.005 |
| 1.576000000000005 | -0.145 | -0.025 | -0.005 |
| 1.580000000000005 | -0.144 | -0.025 | -0.005 |
| 1.584000000000005 | -0.143 | -0.025 | -0.005 |
| 1.588000000000005 | -0.141 | -0.024 | -0.005 |
| 1.592000000000005 | -0.14 | -0.024 | -0.005 |
| 1.596000000000005 | -0.139 | -0.023 | -0.005 |
| 1.600000000000005 | -0.138 | -0.023 | -0.005 |
| 1.604000000000005 | -0.136 | -0.023 | -0.004 |
| 1.608000000000005 | -0.135 | -0.022 | -0.004 |
| 1.612000000000005 | -0.134 | -0.022 | -0.004 |
| 1.616000000000005 | -0.133 | -0.022 | -0.004 |
| 1.620000000000005 | -0.131 | -0.021 | -0.004 |
| 1.624000000000005 | -0.13 | -0.021 | -0.004 |
| 1.628000000000005 | -0.129 | -0.021 | -0.004 |
| 1.632000000000005 | -0.128 | -0.02 | -0.004 |
| 1.636000000000005 | -0.126 | -0.02 | -0.004 |
| 1.640000000000005 | -0.125 | -0.02 | -0.004 |
| 1.644000000000005 | -0.124 | -0.019 | -0.004 |
| 1.648000000000005 | -0.123 | -0.019 | -0.004 |
| 1.652000000000005 | -0.122 | -0.019 | -0.003 |
| 1.656000000000005 | -0.121 | -0.019 | -0.003 |
| 1.660000000000005 | -0.119 | -0.018 | -0.003 |
| 1.664000000000005 | -0.118 | -0.018 | -0.003 |
| 1.668000000000005 | -0.117 | -0.018 | -0.003 |
| 1.672000000000005 | -0.116 | -0.017 | -0.003 |
| 1.676000000000005 | -0.115 | -0.017 | -0.003 |
| 1.680000000000005 | -0.114 | -0.017 | -0.003 |
| 1.684000000000005 | -0.113 | -0.017 | -0.003 |
| 1.688000000000005 | -0.111 | -0.016 | -0.003 |
| 1.692000000000005 | -0.11 | -0.016 | -0.003 |
| 1.696000000000005 | -0.109 | -0.016 | -0.003 |
| 1.700000000000005 | -0.108 | -0.016 | -0.003 |
| 1.704000000000005 | -0.107 | -0.015 | -0.003 |
| 1.708000000000005 | -0.106 | -0.015 | -0.002 |
| 1.712000000000005 | -0.105 | -0.015 | -0.002 |
| 1.716000000000005 | -0.104 | -0.015 | -0.002 |
| 1.720000000000005 | -0.103 | -0.014 | -0.002 |
| 1.724000000000005 | -0.102 | -0.014 | -0.002 |
| 1.728000000000005 | -0.101 | -0.014 | -0.002 |
| 1.732000000000005 | -0.1 | -0.014 | -0.002 |
| 1.736000000000005 | -0.099 | -0.013 | -0.002 |
| 1.740000000000005 | -0.098 | -0.013 | -0.002 |
| 1.744000000000005 | -0.097 | -0.013 | -0.002 |
| 1.748000000000005 | -0.096 | -0.013 | -0.002 |
| 1.752000000000005 | -0.095 | -0.012 | -0.002 |
| 1.756000000000005 | -0.094 | -0.012 | -0.002 |
| 1.760000000000005 | -0.093 | -0.012 | -0.002 |
| 1.764000000000005 | -0.092 | -0.012 | -0.002 |
| 1.768000000000005 | -0.091 | -0.012 | -0.002 |
| 1.772000000000005 | -0.09 | -0.011 | -0.002 |
| 1.776000000000005 | -0.089 | -0.011 | -0.002 |
| 1.780000000000005 | -0.088 | -0.011 | -0.002 |
| 1.784000000000005 | -0.087 | -0.011 | -0.002 |
| 1.788000000000005 | -0.086 | -0.011 | -0.002 |
| 1.792000000000005 | -0.085 | -0.01 | -0.002 |
| 1.796000000000005 | -0.084 | -0.01 | -0.001 |
| 1.800000000000005 | -0.083 | -0.01 | -0.001 |
| 1.804000000000005 | -0.082 | -0.01 | -0.001 |
| 1.808000000000005 | -0.081 | -0.01 | -0.001 |
| 1.812000000000005 | -0.08 | -0.01 | -0.001 |
| 1.816000000000005 | -0.079 | -0.009 | -0.001 |
| 1.820000000000005 | -0.079 | -0.009 | -0.001 |
| 1.824000000000005 | -0.078 | -0.009 | -0.001 |
| 1.828000000000005 | -0.077 | -0.009 | -0.001 |
| 1.832000000000005 | -0.076 | -0.009 | -0.001 |
| 1.836000000000005 | -0.075 | -0.009 | -0.001 |
| 1.840000000000005 | -0.074 | -0.008 | -0.001 |
| 1.844000000000005 | -0.073 | -0.008 | -0.001 |
| 1.848000000000005 | -0.073 | -0.008 | -0.001 |
| 1.852000000000005 | -0.072 | -0.008 | -0.001 |
| 1.856000000000005 | -0.071 | -0.008 | -0.001 |
| 1.860000000000005 | -0.07 | -0.008 | -0.001 |
| 1.864000000000005 | -0.069 | -0.008 | -0.001 |
| 1.868000000000005 | -0.069 | -0.007 | -0.001 |
| 1.872000000000005 | -0.068 | -0.007 | -0.001 |
| 1.876000000000005 | -0.067 | -0.007 | -0.001 |
| 1.880000000000005 | -0.066 | -0.007 | -0.001 |
| 1.884000000000005 | -0.065 | -0.007 | -0.001 |
| 1.888000000000005 | -0.065 | -0.007 | -0.001 |
| 1.892000000000005 | -0.064 | -0.007 | -0.001 |
| 1.896000000000005 | -0.063 | -0.006 | -0.001 |
| 1.900000000000005 | -0.062 | -0.006 | -0.001 |
| 1.904000000000005 | -0.062 | -0.006 | -0.001 |
| 1.908000000000005 | -0.061 | -0.006 | -0.001 |
| 1.912000000000005 | -0.06 | -0.006 | -0.001 |
| 1.916000000000005 | -0.059 | -0.006 | -0.001 |
| 1.920000000000005 | -0.059 | -0.006 | -0.001 |
| 1.924000000000005 | -0.058 | -0.006 | -0.001 |
| 1.928000000000005 | -0.057 | -0.006 | -0.001 |
| 1.932000000000005 | -0.057 | -0.005 | -0.001 |
| 1.936000000000005 | -0.056 | -0.005 | -0.001 |
| 1.940000000000005 | -0.055 | -0.005 | -0.001 |
| 1.944000000000005 | -0.055 | -0.005 | -0.001 |
| 1.948000000000005 | -0.054 | -0.005 | -0.001 |
| 1.952000000000005 | -0.053 | -0.005 | -0.001 |
| 1.956000000000005 | -0.053 | -0.005 | -0.001 |
| 1.960000000000005 | -0.052 | -0.005 | 0 |
| 1.964000000000005 | -0.051 | -0.005 | 0 |
| 1.968000000000005 | -0.051 | -0.005 | 0 |
| 1.972000000000005 | -0.05 | -0.004 | 0 |
| 1.976000000000005 | -0.049 | -0.004 | 0 |
| 1.980000000000005 | -0.049 | -0.004 | 0 |
| 1.984000000000005 | -0.048 | -0.004 | 0 |
| 1.988000000000005 | -0.048 | -0.004 | 0 |
| 1.992000000000005 | -0.047 | -0.004 | 0 |
| 1.996000000000005 | -0.046 | -0.004 | 0 |
| 2.000000000000005 | -0.046 | -0.004 | 0 |
| 2.004000000000005 | -0.045 | -0.004 | 0 |
| 2.008000000000005 | -0.045 | -0.004 | 0 |
| 2.012000000000005 | -0.044 | -0.004 | 0 |
| 2.016000000000005 | -0.043 | -0.004 | 0 |
| 2.020000000000005 | -0.043 | -0.003 | 0 |
| 2.024000000000005 | -0.042 | -0.003 | 0 |
| 2.028000000000005 | -0.042 | -0.003 | 0 |
| 2.032000000000005 | -0.041 | -0.003 | 0 |
| 2.036000000000005 | -0.041 | -0.003 | 0 |
| 2.040000000000005 | -0.04 | -0.003 | 0 |
| 2.044000000000005 | -0.04 | -0.003 | 0 |
| 2.048000000000005 | -0.039 | -0.003 | 0 |
| 2.052000000000005 | -0.039 | -0.003 | 0 |
| 2.056000000000005 | -0.038 | -0.003 | 0 |
| 2.060000000000005 | -0.038 | -0.003 | 0 |
| 2.064000000000005 | -0.037 | -0.003 | 0 |
| 2.068000000000005 | -0.037 | -0.003 | 0 |
| 2.072000000000005 | -0.036 | -0.003 | 0 |
| 2.076000000000005 | -0.036 | -0.003 | 0 |
| 2.080000000000005 | -0.035 | -0.003 | 0 |
| 2.084000000000005 | -0.035 | -0.002 | 0 |
| 2.088000000000005 | -0.034 | -0.002 | 0 |
| 2.092000000000005 | -0.034 | -0.002 | 0 |
| 2.096000000000005 | -0.033 | -0.002 | 0 |
| 2.100000000000005 | -0.033 | -0.002 | 0 |
| 2.104000000000005 | -0.032 | -0.002 | 0 |
| 2.108000000000005 | -0.032 | -0.002 | 0 |
| 2.112000000000005 | -0.032 | -0.002 | 0 |
| 2.116000000000005 | -0.031 | -0.002 | 0 |
| 2.120000000000005 | -0.031 | -0.002 | 0 |
| 2.124000000000005 | -0.03 | -0.002 | 0 |
| 2.128000000000005 | -0.03 | -0.002 | 0 |
| 2.132000000000005 | -0.029 | -0.002 | 0 |
| 2.136000000000005 | -0.029 | -0.002 | 0 |
| 2.140000000000005 | -0.029 | -0.002 | 0 |
| 2.144000000000005 | -0.028 | -0.002 | 0 |
| 2.148000000000005 | -0.028 | -0.002 | 0 |
| 2.152000000000005 | -0.027 | -0.002 | 0 |
| 2.156000000000005 | -0.027 | -0.002 | 0 |
| 2.160000000000005 | -0.027 | -0.002 | 0 |
| 2.164000000000005 | -0.026 | -0.002 | 0 |
| 2.168000000000005 | -0.026 | -0.002 | 0 |
| 2.172000000000005 | -0.026 | -0.002 | 0 |
| 2.176000000000005 | -0.025 | -0.001 | 0 |
| 2.180000000000005 | -0.025 | -0.001 | 0 |
| 2.184000000000005 | -0.024 | -0.001 | 0 |
| 2.188000000000005 | -0.024 | -0.001 | 0 |
| 2.192000000000005 | -0.024 | -0.001 | 0 |
| 2.196000000000005 | -0.023 | -0.001 | 0 |
| 2.200000000000005 | -0.023 | -0.001 | 0 |
| 2.204000000000005 | -0.023 | -0.001 | 0 |
| 2.208000000000005 | -0.022 | -0.001 | 0 |
| 2.212000000000005 | -0.022 | -0.001 | 0 |
| 2.216000000000005 | -0.022 | -0.001 | 0 |
| 2.220000000000005 | -0.021 | -0.001 | 0 |
| 2.224000000000005 | -0.021 | -0.001 | 0 |
| 2.228000000000005 | -0.021 | -0.001 | 0 |
| 2.232000000000005 | -0.021 | -0.001 | 0 |
| 2.236000000000005 | -0.02 | -0.001 | 0 |
| 2.240000000000005 | -0.02 | -0.001 | 0 |
| 2.244000000000005 | -0.02 | -0.001 | 0 |
| 2.248000000000005 | -0.019 | -0.001 | 0 |
| 2.252000000000005 | -0.019 | -0.001 | 0 |
| 2.256000000000005 | -0.019 | -0.001 | 0 |
| 2.260000000000005 | -0.018 | -0.001 | 0 |
| 2.264000000000005 | -0.018 | -0.001 | 0 |
| 2.268000000000005 | -0.018 | -0.001 | 0 |
| 2.272000000000005 | -0.018 | -0.001 | 0 |
| 2.276000000000005 | -0.017 | -0.001 | 0 |
| 2.280000000000005 | -0.017 | -0.001 | 0 |
| 2.284000000000005 | -0.017 | -0.001 | 0 |
| 2.288000000000005 | -0.017 | -0.001 | 0 |
| 2.292000000000005 | -0.016 | -0.001 | 0 |
| 2.296000000000005 | -0.016 | -0.001 | 0 |
| 2.300000000000005 | -0.016 | -0.001 | 0 |
| 2.304000000000005 | -0.016 | -0.001 | 0 |
| 2.308000000000005 | -0.015 | -0.001 | 0 |
| 2.312000000000005 | -0.015 | -0.001 | 0 |
| 2.316000000000005 | -0.015 | -0.001 | 0 |
| 2.320000000000005 | -0.015 | -0.001 | 0 |
| 2.324000000000005 | -0.014 | -0.001 | 0 |
| 2.328000000000005 | -0.014 | -0.001 | 0 |
| 2.332000000000005 | -0.014 | -0.001 | 0 |
| 2.336000000000005 | -0.014 | -0.001 | 0 |
| 2.340000000000005 | -0.014 | -0.001 | 0 |
| 2.344000000000005 | -0.013 | -0.001 | 0 |
| 2.348000000000005 | -0.013 | -0.001 | 0 |
| 2.352000000000005 | -0.013 | -0.001 | 0 |
| 2.356000000000005 | -0.013 | -0.001 | 0 |
| 2.360000000000005 | -0.013 | 0 | 0 |
| 2.364000000000005 | -0.012 | 0 | 0 |
| 2.368000000000005 | -0.012 | 0 | 0 |
| 2.372000000000005 | -0.012 | 0 | 0 |
| 2.376000000000005 | -0.012 | 0 | 0 |
| 2.380000000000005 | -0.012 | 0 | 0 |
| 2.384000000000005 | -0.011 | 0 | 0 |
| 2.388000000000005 | -0.011 | 0 | 0 |
| 2.392000000000005 | -0.011 | 0 | 0 |
| 2.396000000000005 | -0.011 | 0 | 0 |
| 2.400000000000005 | -0.011 | 0 | 0 |
| 2.404000000000005 | -0.01 | 0 | 0 |
| 2.408000000000005 | -0.01 | 0 | 0 |
| 2.412000000000005 | -0.01 | 0 | 0 |
| 2.416000000000005 | -0.01 | 0 | 0 |
| 2.420000000000005 | -0.01 | 0 | 0 |
| 2.424000000000005 | -0.01 | 0 | 0 |
| 2.428000000000005 | -0.009 | 0 | 0 |
| 2.432000000000005 | -0.009 | 0 | 0 |
| 2.436000000000005 | -0.009 | 0 | 0 |
| 2.440000000000005 | -0.009 | 0 | 0 |
| 2.444000000000005 | -0.009 | 0 | 0 |
| 2.448000000000005 | -0.009 | 0 | 0 |
| 2.452000000000005 | -0.009 | 0 | 0 |
| 2.456000000000005 | -0.008 | 0 | 0 |
| 2.460000000000005 | -0.008 | 0 | 0 |
| 2.464000000000005 | -0.008 | 0 | 0 |
| 2.468000000000005 | -0.008 | 0 | 0 |
| 2.472000000000005 | -0.008 | 0 | 0 |
| 2.476000000000005 | -0.008 | 0 | 0 |
| 2.480000000000005 | -0.008 | 0 | 0 |
| 2.484000000000005 | -0.007 | 0 | 0 |
| 2.488000000000005 | -0.007 | 0 | 0 |
| 2.492000000000005 | -0.007 | 0 | 0 |
| 2.496000000000005 | -0.007 | 0 | 0 |
| 2.500000000000005 | -0.007 | 0 | 0 |
| 2.504000000000005 | -0.007 | 0 | 0 |
| 2.508000000000005 | -0.007 | 0 | 0 |
| 2.512000000000005 | -0.007 | 0 | 0 |
| 2.516000000000005 | -0.007 | 0 | 0 |
| 2.520000000000005 | -0.006 | 0 | 0 |
| 2.524000000000005 | -0.006 | 0 | 0 |
| 2.528000000000005 | -0.006 | 0 | 0 |
| 2.532000000000005 | -0.006 | 0 | 0 |
| 2.536000000000005 | -0.006 | 0 | 0 |
| 2.540000000000005 | -0.006 | 0 | 0 |
| 2.544000000000005 | -0.006 | 0 | 0 |
| 2.548000000000005 | -0.006 | 0 | 0 |
| 2.552000000000005 | -0.006 | 0 | 0 |
| 2.556000000000005 | -0.005 | 0 | 0 |
| 2.560000000000005 | -0.005 | 0 | 0 |
| 2.564000000000005 | -0.005 | 0 | 0 |
| 2.568000000000005 | -0.005 | 0 | 0 |
| 2.572000000000005 | -0.005 | 0 | 0 |
| 2.576000000000005 | -0.005 | 0 | 0 |
| 2.580000000000005 | -0.005 | 0 | 0 |
| 2.584000000000005 | -0.005 | 0 | 0 |
| 2.588000000000005 | -0.005 | 0 | 0 |
| 2.592000000000005 | -0.005 | 0 | 0 |
| 2.596000000000005 | -0.005 | 0 | 0 |
| 2.600000000000005 | -0.004 | 0 | 0 |
| 2.604000000000005 | -0.004 | 0 | 0 |
| 2.608000000000005 | -0.004 | 0 | 0 |
| 2.612000000000005 | -0.004 | 0 | 0 |
| 2.616000000000005 | -0.004 | 0 | 0 |
| 2.620000000000005 | -0.004 | 0 | 0 |
| 2.624000000000005 | -0.004 | 0 | 0 |
| 2.628000000000005 | -0.004 | 0 | 0 |
| 2.632000000000005 | -0.004 | 0 | 0 |
| 2.636000000000005 | -0.004 | 0 | 0 |
| 2.640000000000005 | -0.004 | 0 | 0 |
| 2.644000000000005 | -0.004 | 0 | 0 |
| 2.648000000000005 | -0.004 | 0 | 0 |
| 2.652000000000005 | -0.004 | 0 | 0 |
| 2.656000000000005 | -0.003 | 0 | 0 |
| 2.660000000000005 | -0.003 | 0 | 0 |
| 2.664000000000005 | -0.003 | 0 | 0 |
| 2.668000000000005 | -0.003 | 0 | 0 |
| 2.672000000000005 | -0.003 | 0 | 0 |
| 2.676000000000005 | -0.003 | 0 | 0 |
| 2.680000000000005 | -0.003 | 0 | 0 |
| 2.684000000000005 | -0.003 | 0 | 0 |
| 2.688000000000005 | -0.003 | 0 | 0 |
| 2.692000000000005 | -0.003 | 0 | 0 |
| 2.696000000000005 | -0.003 | 0 | 0 |
| 2.700000000000005 | -0.003 | 0 | 0 |
| 2.704000000000005 | -0.003 | 0 | 0 |
| 2.708000000000005 | -0.003 | 0 | 0 |
| 2.712000000000005 | -0.003 | 0 | 0 |
| 2.716000000000005 | -0.003 | 0 | 0 |
| 2.720000000000005 | -0.003 | 0 | 0 |
| 2.724000000000005 | -0.003 | 0 | 0 |
| 2.728000000000005 | -0.002 | 0 | 0 |
| 2.732000000000005 | -0.002 | 0 | 0 |
| 2.736000000000005 | -0.002 | 0 | 0 |
| 2.740000000000005 | -0.002 | 0 | 0 |
| 2.744000000000005 | -0.002 | 0 | 0 |
| 2.748000000000005 | -0.002 | 0 | 0 |
| 2.752000000000005 | -0.002 | 0 | 0 |
| 2.756000000000005 | -0.002 | 0 | 0 |
| 2.760000000000005 | -0.002 | 0 | 0 |
| 2.764000000000005 | -0.002 | 0 | 0 |
| 2.768000000000005 | -0.002 | 0 | 0 |
| 2.772000000000005 | -0.002 | 0 | 0 |
| 2.776000000000005 | -0.002 | 0 | 0 |
| 2.780000000000005 | -0.002 | 0 | 0 |
| 2.784000000000005 | -0.002 | 0 | 0 |
| 2.788000000000006 | -0.002 | 0 | 0 |
| 2.792000000000005 | -0.002 | 0 | 0 |
| 2.796000000000005 | -0.002 | 0 | 0 |
| 2.800000000000006 | -0.002 | 0 | 0 |
| 2.804000000000006 | -0.002 | 0 | 0 |
| 2.808000000000006 | -0.002 | 0 | 0 |
| 2.812000000000006 | -0.002 | 0 | 0 |
| 2.816000000000006 | -0.002 | 0 | 0 |
| 2.820000000000006 | -0.002 | 0 | 0 |
| 2.824000000000006 | -0.002 | 0 | 0 |
| 2.828000000000006 | -0.002 | 0 | 0 |
| 2.832000000000006 | -0.001 | 0 | 0 |
| 2.836000000000006 | -0.001 | 0 | 0 |
| 2.840000000000006 | -0.001 | 0 | 0 |
| 2.844000000000006 | -0.001 | 0 | 0 |
| 2.848000000000006 | -0.001 | 0 | 0 |
| 2.852000000000006 | -0.001 | 0 | 0 |
| 2.856000000000006 | -0.001 | 0 | 0 |
| 2.860000000000006 | -0.001 | 0 | 0 |
| 2.864000000000006 | -0.001 | 0 | 0 |
| 2.868000000000006 | -0.001 | 0 | 0 |
| 2.872000000000006 | -0.001 | 0 | 0 |
| 2.876000000000006 | -0.001 | 0 | 0 |
| 2.880000000000006 | -0.001 | 0 | 0 |
| 2.884000000000006 | -0.001 | 0 | 0 |
| 2.888000000000006 | -0.001 | 0 | 0 |
| 2.892000000000006 | -0.001 | 0 | 0 |
| 2.896000000000006 | -0.001 | 0 | 0 |
| 2.900000000000006 | -0.001 | 0 | 0 |
| 2.904000000000006 | -0.001 | 0 | 0 |
| 2.908000000000006 | -0.001 | 0 | 0 |
| 2.912000000000006 | -0.001 | 0 | 0 |
| 2.916000000000006 | -0.001 | 0 | 0 |
| 2.920000000000006 | -0.001 | 0 | 0 |
| 2.924000000000006 | -0.001 | 0 | 0 |
| 2.928000000000006 | -0.001 | 0 | 0 |
| 2.932000000000006 | -0.001 | 0 | 0 |
| 2.936000000000006 | -0.001 | 0 | 0 |
| 2.940000000000006 | -0.001 | 0 | 0 |
| 2.944000000000006 | -0.001 | 0 | 0 |
| 2.948000000000006 | -0.001 | 0 | 0 |
| 2.952000000000006 | -0.001 | 0 | 0 |
| 2.956000000000006 | -0.001 | 0 | 0 |
| 2.960000000000006 | -0.001 | 0 | 0 |
| 2.964000000000006 | -0.001 | 0 | 0 |
| 2.968000000000006 | -0.001 | 0 | 0 |
| 2.972000000000006 | -0.001 | 0 | 0 |
| 2.976000000000006 | -0.001 | 0 | 0 |
| 2.980000000000006 | -0.001 | 0 | 0 |
| 2.984000000000006 | -0.001 | 0 | 0 |
| 2.988000000000006 | -0.001 | 0 | 0 |
| 2.992000000000006 | -0.001 | 0 | 0 |
| 2.996000000000006 | -0.001 | 0 | 0 |
| 3.000000000000006 | -0.001 | 0 | 0 |
| 3.004000000000006 | -0.001 | 0 | 0 |
| 3.008000000000006 | -0.001 | 0 | 0 |
| 3.012000000000006 | -0.001 | 0 | 0 |
| 3.016000000000006 | -0.001 | 0 | 0 |
| 3.020000000000006 | -0.001 | 0 | 0 |
| 3.024000000000006 | -0.001 | 0 | 0 |
| 3.028000000000006 | -0.001 | 0 | 0 |
| 3.032000000000006 | -0.001 | 0 | 0 |
| 3.036000000000006 | -0.001 | 0 | 0 |
| 3.040000000000006 | 0 | 0 | 0 |
| 3.044000000000006 | 0 | 0 | 0 |
| 3.048000000000006 | 0 | 0 | 0 |
| 3.052000000000006 | 0 | 0 | 0 |
| 3.056000000000006 | 0 | 0 | 0 |
| 3.060000000000006 | 0 | 0 | 0 |
| 3.064000000000006 | 0 | 0 | 0 |
| 3.068000000000006 | 0 | 0 | 0 |
| 3.072000000000006 | 0 | 0 | 0 |
| 3.076000000000006 | 0 | 0 | 0 |
| 3.080000000000006 | 0 | 0 | 0 |
| 3.084000000000006 | 0 | 0 | 0 |
| 3.088000000000006 | 0 | 0 | 0 |
| 3.092000000000006 | 0 | 0 | 0 |
| 3.096000000000006 | 0 | 0 | 0 |
| 3.100000000000006 | 0 | 0 | 0 |
| 3.104000000000006 | 0 | 0 | 0 |
| 3.108000000000006 | 0 | 0 | 0 |
| 3.112000000000006 | 0 | 0 | 0 |
| 3.116000000000006 | 0 | 0 | 0 |
| 3.120000000000006 | 0 | 0 | 0 |
| 3.124000000000006 | 0 | 0 | 0 |
| 3.128000000000006 | 0 | 0 | 0 |
| 3.132000000000006 | 0 | 0 | 0 |
| 3.136000000000006 | 0 | 0 | 0 |
| 3.140000000000006 | 0 | 0 | 0 |
| 3.144000000000006 | 0 | 0 | 0 |
| 3.148000000000006 | 0 | 0 | 0 |
| 3.152000000000006 | 0 | 0 | 0 |
| 3.156000000000006 | 0 | 0 | 0 |
| 3.160000000000006 | 0 | 0 | 0 |
| 3.164000000000006 | 0 | 0 | 0 |
| 3.168000000000006 | 0 | 0 | 0 |
| 3.172000000000006 | 0 | 0 | 0 |
| 3.176000000000006 | 0 | 0 | 0 |
| 3.180000000000006 | 0 | 0 | 0 |
| 3.184000000000006 | 0 | 0 | 0 |
| 3.188000000000006 | 0 | 0 | 0 |
| 3.192000000000006 | 0 | 0 | 0 |
| 3.196000000000006 | 0 | 0 | 0 |
| 3.200000000000006 | 0 | 0 | 0 |
| 3.204000000000006 | 0 | 0 | 0 |
| 3.208000000000006 | 0 | 0 | 0 |
| 3.212000000000006 | 0 | 0 | 0 |
| 3.216000000000006 | 0 | 0 | 0 |
| 3.220000000000006 | 0 | 0 | 0 |
| 3.224000000000006 | 0 | 0 | 0 |
| 3.228000000000006 | 0 | 0 | 0 |
| 3.232000000000006 | 0 | 0 | 0 |
| 3.236000000000006 | 0 | 0 | 0 |
| 3.240000000000006 | 0 | 0 | 0 |
| 3.244000000000006 | 0 | 0 | 0 |
| 3.248000000000006 | 0 | 0 | 0 |
| 3.252000000000006 | 0 | 0 | 0 |
| 3.256000000000006 | 0 | 0 | 0 |
| 3.260000000000006 | 0 | 0 | 0 |
| 3.264000000000006 | 0 | 0 | 0 |
| 3.268000000000006 | 0 | 0 | 0 |
| 3.272000000000006 | 0 | 0 | 0 |
| 3.276000000000006 | 0 | 0 | 0 |
| 3.280000000000006 | 0 | 0 | 0 |
| 3.284000000000006 | 0 | 0 | 0 |
| 3.288000000000006 | 0 | 0 | 0 |
| 3.292000000000006 | 0 | 0 | 0 |
| 3.296000000000006 | 0 | 0 | 0 |
| 3.300000000000006 | 0 | 0 | 0 |
| 3.304000000000006 | 0 | 0 | 0 |
| 3.308000000000006 | 0 | 0 | 0 |
| 3.312000000000006 | 0 | 0 | 0 |
| 3.316000000000006 | 0 | 0 | 0 |
| 3.320000000000006 | 0 | 0 | 0 |
| 3.324000000000006 | 0 | 0 | 0 |
| 3.328000000000006 | 0 | 0 | 0 |
| 3.332000000000006 | 0 | 0 | 0 |
| 3.336000000000006 | 0 | 0 | 0 |
| 3.340000000000006 | 0 | 0 | 0 |
| 3.344000000000006 | 0 | 0 | 0 |
| 3.348000000000006 | 0 | 0 | 0 |
| 3.352000000000006 | 0 | 0 | 0 |
| 3.356000000000006 | 0 | 0 | 0 |
| 3.360000000000006 | 0 | 0 | 0 |
| 3.364000000000006 | 0 | 0 | 0 |
| 3.368000000000006 | 0 | 0 | 0 |
| 3.372000000000006 | 0 | 0 | 0 |
| 3.376000000000006 | 0 | 0 | 0 |
| 3.380000000000006 | 0 | 0 | 0 |
| 3.384000000000006 | 0 | 0 | 0 |
| 3.388000000000006 | 0 | 0 | 0 |
| 3.392000000000006 | 0 | 0 | 0 |
| 3.396000000000006 | 0 | 0 | 0 |
| 3.400000000000006 | 0 | 0 | 0 |
| 3.404000000000006 | 0 | 0 | 0 |
| 3.408000000000006 | 0 | 0 | 0 |
| 3.412000000000006 | 0 | 0 | 0 |
| 3.416000000000006 | 0 | 0 | 0 |
| 3.420000000000006 | 0 | 0 | 0 |
| 3.424000000000006 | 0 | 0 | 0 |
| 3.428000000000006 | 0 | 0 | 0 |
| 3.432000000000006 | 0 | 0 | 0 |
| 3.436000000000006 | 0 | 0 | 0 |
| 3.440000000000006 | 0 | 0 | 0 |
| 3.444000000000006 | 0 | 0 | 0 |
| 3.448000000000006 | 0 | 0 | 0 |
| 3.452000000000006 | 0 | 0 | 0 |
| 3.456000000000006 | 0 | 0 | 0 |
| 3.460000000000006 | 0 | 0 | 0 |
| 3.464000000000006 | 0 | 0 | 0 |
| 3.468000000000006 | 0 | 0 | 0 |
| 3.472000000000006 | 0 | 0 | 0 |
| 3.476000000000006 | 0 | 0 | 0 |
| 3.480000000000006 | 0 | 0 | 0 |
| 3.484000000000006 | 0 | 0 | 0 |
| 3.488000000000006 | 0 | 0 | 0 |
| 3.492000000000006 | 0 | 0 | 0 |
| 3.496000000000006 | 0 | 0 | 0 |
| 3.500000000000006 | 0 | 0 | 0 |
| 3.504000000000006 | 0 | 0 | 0 |
| 3.508000000000006 | 0 | 0 | 0 |
| 3.512000000000006 | 0 | 0 | 0 |
| 3.516000000000006 | 0 | 0 | 0 |
| 3.520000000000006 | 0 | 0 | 0 |
| 3.524000000000006 | 0 | 0 | 0 |
| 3.528000000000006 | 0 | 0 | 0 |
| 3.532000000000006 | 0 | 0 | 0 |
| 3.536000000000006 | 0 | 0 | 0 |
| 3.540000000000006 | 0 | 0 | 0 |
| 3.544000000000006 | 0 | 0 | 0 |
| 3.548000000000006 | 0 | 0 | 0 |
| 3.552000000000006 | 0 | 0 | 0 |
| 3.556000000000006 | 0 | 0 | 0 |
| 3.560000000000006 | 0 | 0 | 0 |
| 3.564000000000006 | 0 | 0 | 0 |
| 3.568000000000006 | 0 | 0 | 0 |
| 3.572000000000006 | 0 | 0 | 0 |
| 3.576000000000006 | 0 | 0 | 0 |
| 3.580000000000006 | 0 | 0 | 0 |
| 3.584000000000006 | 0 | 0 | 0 |
| 3.588000000000006 | 0 | 0 | 0 |
| 3.592000000000006 | 0 | 0 | 0 |
| 3.596000000000006 | 0 | 0 | 0 |
| 3.600000000000006 | 0 | 0 | 0 |
| 3.604000000000006 | 0 | 0 | 0 |
| 3.608000000000006 | 0 | 0 | 0 |
| 3.612000000000006 | 0 | 0 | 0 |
| 3.616000000000006 | 0 | 0 | 0 |
| 3.620000000000006 | 0 | 0 | 0 |
| 3.624000000000006 | 0 | 0 | 0 |
| 3.628000000000006 | 0 | 0 | 0 |
| 3.632000000000006 | 0 | 0 | 0 |
| 3.636000000000006 | 0 | 0 | 0 |
| 3.640000000000006 | 0 | 0 | 0 |
| 3.644000000000006 | 0 | 0 | 0 |
| 3.648000000000006 | 0 | 0 | 0 |
| 3.652000000000006 | 0 | 0 | 0 |
| 3.656000000000006 | 0 | 0 | 0 |
| 3.660000000000006 | 0 | 0 | 0 |
| 3.664000000000006 | 0 | 0 | 0 |
| 3.668000000000006 | 0 | 0 | 0 |
| 3.672000000000006 | 0 | 0 | 0 |
| 3.676000000000006 | 0 | 0 | 0 |
| 3.680000000000006 | 0 | 0 | 0 |
| 3.684000000000006 | 0 | 0 | 0 |
| 3.688000000000006 | 0 | 0 | 0 |
| 3.692000000000006 | 0 | 0 | 0 |
| 3.696000000000006 | 0 | 0 | 0 |
| 3.700000000000006 | 0 | 0 | 0 |
| 3.704000000000006 | 0 | 0 | 0 |
| 3.708000000000006 | 0 | 0 | 0 |
| 3.712000000000006 | 0 | 0 | 0 |
| 3.716000000000006 | 0 | 0 | 0 |
| 3.720000000000006 | 0 | 0 | 0 |
| 3.724000000000006 | 0 | 0 | 0 |
| 3.728000000000006 | 0 | 0 | 0 |
| 3.732000000000006 | 0 | 0 | 0 |
| 3.736000000000006 | 0 | 0 | 0 |
| 3.740000000000006 | 0 | 0 | 0 |
| 3.744000000000006 | 0 | 0 | 0 |
| 3.748000000000006 | 0 | 0 | 0 |
| 3.752000000000006 | 0 | 0 | 0 |
| 3.756000000000006 | 0 | 0 | 0 |
| 3.760000000000006 | 0 | 0 | 0 |
| 3.764000000000006 | 0 | 0 | 0 |
| 3.768000000000006 | 0 | 0 | 0 |
| 3.772000000000006 | 0 | 0 | 0 |
| 3.776000000000006 | 0 | 0 | 0 |
| 3.780000000000006 | 0 | 0 | 0 |
| 3.784000000000006 | 0 | 0 | 0 |
| 3.788000000000006 | 0 | 0 | 0 |
| 3.792000000000006 | 0 | 0 | 0 |
| 3.796000000000006 | 0 | 0 | 0 |
| 3.800000000000006 | 0 | 0 | 0 |
| 3.804000000000006 | 0 | 0 | 0 |
| 3.808000000000006 | 0 | 0 | 0 |
| 3.812000000000006 | 0 | 0 | 0 |
| 3.816000000000006 | 0 | 0 | 0 |
| 3.820000000000006 | 0 | 0 | 0 |
| 3.824000000000006 | 0 | 0 | 0 |
| 3.828000000000006 | 0 | 0 | 0 |
| 3.832000000000006 | 0 | 0 | 0 |
| 3.836000000000006 | 0 | 0 | 0 |
| 3.840000000000006 | 0 | 0 | 0 |
| 3.844000000000006 | 0 | 0 | 0 |
| 3.848000000000006 | 0 | 0 | 0 |
| 3.852000000000006 | 0 | 0 | 0 |
| 3.856000000000006 | 0 | 0 | 0 |
| 3.860000000000006 | 0 | 0 | 0 |
| 3.864000000000006 | 0 | 0 | 0 |
| 3.868000000000006 | 0 | 0 | 0 |
| 3.872000000000006 | 0 | 0 | 0 |
| 3.876000000000006 | 0 | 0 | 0 |
| 3.880000000000006 | 0 | 0 | 0 |
| 3.884000000000006 | 0 | 0 | 0 |
| 3.888000000000007 | 0 | 0 | 0 |
| 3.892000000000006 | 0 | 0 | 0 |
| 3.896000000000006 | 0 | 0 | 0 |
| 3.900000000000007 | 0 | 0 | 0 |
| 3.904000000000007 | 0 | 0 | 0 |
| 3.908000000000007 | 0 | 0 | 0 |
| 3.912000000000007 | 0 | 0 | 0 |
| 3.916000000000007 | 0 | 0 | 0 |
| 3.920000000000007 | 0 | 0 | 0 |
| 3.924000000000007 | 0 | 0 | 0 |
| 3.928000000000007 | 0 | 0 | 0 |
| 3.932000000000007 | 0 | 0 | 0 |
| 3.936000000000007 | 0 | 0 | 0 |
| 3.940000000000007 | 0 | 0 | 0 |
| 3.944000000000007 | 0 | 0 | 0 |
| 3.948000000000007 | 0 | 0 | 0 |
| 3.952000000000007 | 0 | 0 | 0 |
| 3.956000000000007 | 0 | 0 | 0 |
| 3.960000000000007 | 0 | 0 | 0 |
| 3.964000000000007 | 0 | 0 | 0 |
| 3.968000000000007 | 0 | 0 | 0 |
| 3.972000000000007 | 0 | 0 | 0 |
| 3.976000000000007 | 0 | 0 | 0 |
| 3.980000000000007 | 0 | 0 | 0 |
| 3.984000000000007 | 0 | 0 | 0 |
| 3.988000000000007 | 0 | 0 | 0 |
| 3.992000000000007 | 0 | 0 | 0 |
| 3.996000000000007 | 0 | 0 | 0 |
| 4.000000000000006 | 0 | 0 | 0 |